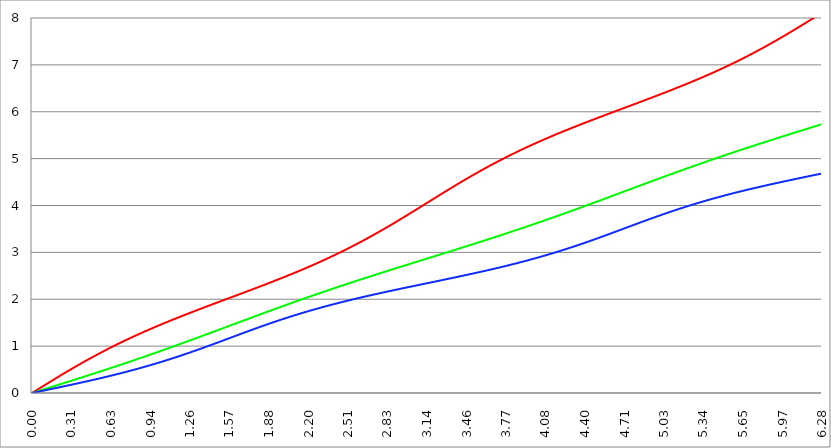
| Category | Series 1 | Series 0 | Series 2 |
|---|---|---|---|
| 0.0 | 0 | 0 | 0 |
| 0.00314159265358979 | 0.005 | 0.003 | 0.002 |
| 0.00628318530717958 | 0.01 | 0.005 | 0.003 |
| 0.00942477796076938 | 0.016 | 0.008 | 0.005 |
| 0.0125663706143592 | 0.021 | 0.01 | 0.007 |
| 0.015707963267949 | 0.026 | 0.013 | 0.009 |
| 0.0188495559215388 | 0.031 | 0.016 | 0.01 |
| 0.0219911485751285 | 0.037 | 0.018 | 0.012 |
| 0.0251327412287183 | 0.042 | 0.021 | 0.014 |
| 0.0282743338823081 | 0.047 | 0.024 | 0.016 |
| 0.0314159265358979 | 0.052 | 0.026 | 0.017 |
| 0.0345575191894877 | 0.058 | 0.029 | 0.019 |
| 0.0376991118430775 | 0.063 | 0.031 | 0.021 |
| 0.0408407044966673 | 0.068 | 0.034 | 0.023 |
| 0.0439822971502571 | 0.073 | 0.037 | 0.024 |
| 0.0471238898038469 | 0.079 | 0.039 | 0.026 |
| 0.0502654824574367 | 0.084 | 0.042 | 0.028 |
| 0.0534070751110265 | 0.089 | 0.045 | 0.03 |
| 0.0565486677646163 | 0.094 | 0.047 | 0.031 |
| 0.059690260418206 | 0.099 | 0.05 | 0.033 |
| 0.0628318530717958 | 0.105 | 0.052 | 0.035 |
| 0.0659734457253856 | 0.11 | 0.055 | 0.037 |
| 0.0691150383789754 | 0.115 | 0.058 | 0.038 |
| 0.0722566310325652 | 0.12 | 0.06 | 0.04 |
| 0.075398223686155 | 0.126 | 0.063 | 0.042 |
| 0.0785398163397448 | 0.131 | 0.065 | 0.044 |
| 0.0816814089933346 | 0.136 | 0.068 | 0.045 |
| 0.0848230016469244 | 0.141 | 0.071 | 0.047 |
| 0.0879645943005142 | 0.146 | 0.073 | 0.049 |
| 0.091106186954104 | 0.152 | 0.076 | 0.051 |
| 0.0942477796076937 | 0.157 | 0.079 | 0.052 |
| 0.0973893722612835 | 0.162 | 0.081 | 0.054 |
| 0.100530964914873 | 0.167 | 0.084 | 0.056 |
| 0.103672557568463 | 0.172 | 0.086 | 0.058 |
| 0.106814150222053 | 0.178 | 0.089 | 0.059 |
| 0.109955742875643 | 0.183 | 0.092 | 0.061 |
| 0.113097335529233 | 0.188 | 0.094 | 0.063 |
| 0.116238928182822 | 0.193 | 0.097 | 0.065 |
| 0.119380520836412 | 0.198 | 0.1 | 0.066 |
| 0.122522113490002 | 0.204 | 0.102 | 0.068 |
| 0.125663706143592 | 0.209 | 0.105 | 0.07 |
| 0.128805298797181 | 0.214 | 0.107 | 0.072 |
| 0.131946891450771 | 0.219 | 0.11 | 0.073 |
| 0.135088484104361 | 0.224 | 0.113 | 0.075 |
| 0.138230076757951 | 0.229 | 0.115 | 0.077 |
| 0.141371669411541 | 0.235 | 0.118 | 0.079 |
| 0.14451326206513 | 0.24 | 0.121 | 0.081 |
| 0.14765485471872 | 0.245 | 0.123 | 0.082 |
| 0.15079644737231 | 0.25 | 0.126 | 0.084 |
| 0.1539380400259 | 0.255 | 0.128 | 0.086 |
| 0.15707963267949 | 0.26 | 0.131 | 0.088 |
| 0.160221225333079 | 0.266 | 0.134 | 0.089 |
| 0.163362817986669 | 0.271 | 0.136 | 0.091 |
| 0.166504410640259 | 0.276 | 0.139 | 0.093 |
| 0.169646003293849 | 0.281 | 0.142 | 0.095 |
| 0.172787595947439 | 0.286 | 0.144 | 0.096 |
| 0.175929188601028 | 0.291 | 0.147 | 0.098 |
| 0.179070781254618 | 0.296 | 0.149 | 0.1 |
| 0.182212373908208 | 0.301 | 0.152 | 0.102 |
| 0.185353966561798 | 0.307 | 0.155 | 0.103 |
| 0.188495559215388 | 0.312 | 0.157 | 0.105 |
| 0.191637151868977 | 0.317 | 0.16 | 0.107 |
| 0.194778744522567 | 0.322 | 0.163 | 0.109 |
| 0.197920337176157 | 0.327 | 0.165 | 0.111 |
| 0.201061929829747 | 0.332 | 0.168 | 0.112 |
| 0.204203522483336 | 0.337 | 0.171 | 0.114 |
| 0.207345115136926 | 0.342 | 0.173 | 0.116 |
| 0.210486707790516 | 0.347 | 0.176 | 0.118 |
| 0.213628300444106 | 0.353 | 0.178 | 0.119 |
| 0.216769893097696 | 0.358 | 0.181 | 0.121 |
| 0.219911485751285 | 0.363 | 0.184 | 0.123 |
| 0.223053078404875 | 0.368 | 0.186 | 0.125 |
| 0.226194671058465 | 0.373 | 0.189 | 0.127 |
| 0.229336263712055 | 0.378 | 0.192 | 0.128 |
| 0.232477856365645 | 0.383 | 0.194 | 0.13 |
| 0.235619449019234 | 0.388 | 0.197 | 0.132 |
| 0.238761041672824 | 0.393 | 0.2 | 0.134 |
| 0.241902634326414 | 0.398 | 0.202 | 0.136 |
| 0.245044226980004 | 0.403 | 0.205 | 0.137 |
| 0.248185819633594 | 0.408 | 0.208 | 0.139 |
| 0.251327412287183 | 0.413 | 0.21 | 0.141 |
| 0.254469004940773 | 0.418 | 0.213 | 0.143 |
| 0.257610597594363 | 0.423 | 0.215 | 0.145 |
| 0.260752190247953 | 0.428 | 0.218 | 0.146 |
| 0.263893782901543 | 0.433 | 0.221 | 0.148 |
| 0.267035375555132 | 0.438 | 0.223 | 0.15 |
| 0.270176968208722 | 0.443 | 0.226 | 0.152 |
| 0.273318560862312 | 0.448 | 0.229 | 0.154 |
| 0.276460153515902 | 0.453 | 0.231 | 0.155 |
| 0.279601746169492 | 0.458 | 0.234 | 0.157 |
| 0.282743338823082 | 0.463 | 0.237 | 0.159 |
| 0.285884931476671 | 0.468 | 0.239 | 0.161 |
| 0.289026524130261 | 0.473 | 0.242 | 0.163 |
| 0.292168116783851 | 0.478 | 0.245 | 0.164 |
| 0.295309709437441 | 0.483 | 0.247 | 0.166 |
| 0.298451302091031 | 0.488 | 0.25 | 0.168 |
| 0.30159289474462 | 0.493 | 0.253 | 0.17 |
| 0.30473448739821 | 0.498 | 0.255 | 0.172 |
| 0.3078760800518 | 0.503 | 0.258 | 0.173 |
| 0.31101767270539 | 0.508 | 0.261 | 0.175 |
| 0.31415926535898 | 0.513 | 0.263 | 0.177 |
| 0.31730085801257 | 0.518 | 0.266 | 0.179 |
| 0.320442450666159 | 0.523 | 0.269 | 0.181 |
| 0.323584043319749 | 0.527 | 0.271 | 0.183 |
| 0.326725635973339 | 0.532 | 0.274 | 0.184 |
| 0.329867228626929 | 0.537 | 0.277 | 0.186 |
| 0.333008821280519 | 0.542 | 0.279 | 0.188 |
| 0.336150413934108 | 0.547 | 0.282 | 0.19 |
| 0.339292006587698 | 0.552 | 0.285 | 0.192 |
| 0.342433599241288 | 0.557 | 0.287 | 0.194 |
| 0.345575191894878 | 0.562 | 0.29 | 0.195 |
| 0.348716784548468 | 0.567 | 0.293 | 0.197 |
| 0.351858377202058 | 0.571 | 0.295 | 0.199 |
| 0.354999969855647 | 0.576 | 0.298 | 0.201 |
| 0.358141562509237 | 0.581 | 0.301 | 0.203 |
| 0.361283155162827 | 0.586 | 0.303 | 0.205 |
| 0.364424747816417 | 0.591 | 0.306 | 0.206 |
| 0.367566340470007 | 0.596 | 0.309 | 0.208 |
| 0.370707933123597 | 0.6 | 0.311 | 0.21 |
| 0.373849525777186 | 0.605 | 0.314 | 0.212 |
| 0.376991118430776 | 0.61 | 0.317 | 0.214 |
| 0.380132711084366 | 0.615 | 0.319 | 0.216 |
| 0.383274303737956 | 0.62 | 0.322 | 0.218 |
| 0.386415896391546 | 0.624 | 0.325 | 0.219 |
| 0.389557489045135 | 0.629 | 0.327 | 0.221 |
| 0.392699081698725 | 0.634 | 0.33 | 0.223 |
| 0.395840674352315 | 0.639 | 0.333 | 0.225 |
| 0.398982267005905 | 0.643 | 0.335 | 0.227 |
| 0.402123859659495 | 0.648 | 0.338 | 0.229 |
| 0.405265452313085 | 0.653 | 0.341 | 0.231 |
| 0.408407044966674 | 0.658 | 0.343 | 0.233 |
| 0.411548637620264 | 0.662 | 0.346 | 0.234 |
| 0.414690230273854 | 0.667 | 0.349 | 0.236 |
| 0.417831822927444 | 0.672 | 0.352 | 0.238 |
| 0.420973415581034 | 0.677 | 0.354 | 0.24 |
| 0.424115008234623 | 0.681 | 0.357 | 0.242 |
| 0.427256600888213 | 0.686 | 0.36 | 0.244 |
| 0.430398193541803 | 0.691 | 0.362 | 0.246 |
| 0.433539786195393 | 0.695 | 0.365 | 0.248 |
| 0.436681378848983 | 0.7 | 0.368 | 0.25 |
| 0.439822971502573 | 0.705 | 0.37 | 0.251 |
| 0.442964564156162 | 0.709 | 0.373 | 0.253 |
| 0.446106156809752 | 0.714 | 0.376 | 0.255 |
| 0.449247749463342 | 0.719 | 0.378 | 0.257 |
| 0.452389342116932 | 0.723 | 0.381 | 0.259 |
| 0.455530934770522 | 0.728 | 0.384 | 0.261 |
| 0.458672527424111 | 0.733 | 0.387 | 0.263 |
| 0.461814120077701 | 0.737 | 0.389 | 0.265 |
| 0.464955712731291 | 0.742 | 0.392 | 0.267 |
| 0.468097305384881 | 0.747 | 0.395 | 0.269 |
| 0.471238898038471 | 0.751 | 0.397 | 0.271 |
| 0.474380490692061 | 0.756 | 0.4 | 0.272 |
| 0.47752208334565 | 0.76 | 0.403 | 0.274 |
| 0.48066367599924 | 0.765 | 0.406 | 0.276 |
| 0.48380526865283 | 0.77 | 0.408 | 0.278 |
| 0.48694686130642 | 0.774 | 0.411 | 0.28 |
| 0.49008845396001 | 0.779 | 0.414 | 0.282 |
| 0.493230046613599 | 0.783 | 0.416 | 0.284 |
| 0.496371639267189 | 0.788 | 0.419 | 0.286 |
| 0.499513231920779 | 0.792 | 0.422 | 0.288 |
| 0.502654824574369 | 0.797 | 0.425 | 0.29 |
| 0.505796417227959 | 0.801 | 0.427 | 0.292 |
| 0.508938009881549 | 0.806 | 0.43 | 0.294 |
| 0.512079602535138 | 0.81 | 0.433 | 0.296 |
| 0.515221195188728 | 0.815 | 0.436 | 0.298 |
| 0.518362787842318 | 0.819 | 0.438 | 0.3 |
| 0.521504380495908 | 0.824 | 0.441 | 0.302 |
| 0.524645973149498 | 0.828 | 0.444 | 0.304 |
| 0.527787565803087 | 0.833 | 0.446 | 0.306 |
| 0.530929158456677 | 0.837 | 0.449 | 0.307 |
| 0.534070751110267 | 0.842 | 0.452 | 0.309 |
| 0.537212343763857 | 0.846 | 0.455 | 0.311 |
| 0.540353936417447 | 0.851 | 0.457 | 0.313 |
| 0.543495529071037 | 0.855 | 0.46 | 0.315 |
| 0.546637121724626 | 0.86 | 0.463 | 0.317 |
| 0.549778714378216 | 0.864 | 0.466 | 0.319 |
| 0.552920307031806 | 0.868 | 0.468 | 0.321 |
| 0.556061899685396 | 0.873 | 0.471 | 0.323 |
| 0.559203492338986 | 0.877 | 0.474 | 0.325 |
| 0.562345084992576 | 0.882 | 0.477 | 0.327 |
| 0.565486677646165 | 0.886 | 0.479 | 0.329 |
| 0.568628270299755 | 0.891 | 0.482 | 0.331 |
| 0.571769862953345 | 0.895 | 0.485 | 0.333 |
| 0.574911455606935 | 0.899 | 0.488 | 0.335 |
| 0.578053048260525 | 0.904 | 0.49 | 0.337 |
| 0.581194640914114 | 0.908 | 0.493 | 0.339 |
| 0.584336233567704 | 0.912 | 0.496 | 0.341 |
| 0.587477826221294 | 0.917 | 0.499 | 0.343 |
| 0.590619418874884 | 0.921 | 0.501 | 0.345 |
| 0.593761011528474 | 0.925 | 0.504 | 0.347 |
| 0.596902604182064 | 0.93 | 0.507 | 0.349 |
| 0.600044196835653 | 0.934 | 0.51 | 0.352 |
| 0.603185789489243 | 0.938 | 0.512 | 0.354 |
| 0.606327382142833 | 0.943 | 0.515 | 0.356 |
| 0.609468974796423 | 0.947 | 0.518 | 0.358 |
| 0.612610567450013 | 0.951 | 0.521 | 0.36 |
| 0.615752160103602 | 0.956 | 0.524 | 0.362 |
| 0.618893752757192 | 0.96 | 0.526 | 0.364 |
| 0.622035345410782 | 0.964 | 0.529 | 0.366 |
| 0.625176938064372 | 0.968 | 0.532 | 0.368 |
| 0.628318530717962 | 0.973 | 0.535 | 0.37 |
| 0.631460123371551 | 0.977 | 0.537 | 0.372 |
| 0.634601716025141 | 0.981 | 0.54 | 0.374 |
| 0.637743308678731 | 0.985 | 0.543 | 0.376 |
| 0.640884901332321 | 0.99 | 0.546 | 0.378 |
| 0.644026493985911 | 0.994 | 0.549 | 0.38 |
| 0.647168086639501 | 0.998 | 0.551 | 0.382 |
| 0.65030967929309 | 1.002 | 0.554 | 0.384 |
| 0.65345127194668 | 1.006 | 0.557 | 0.387 |
| 0.65659286460027 | 1.011 | 0.56 | 0.389 |
| 0.65973445725386 | 1.015 | 0.562 | 0.391 |
| 0.66287604990745 | 1.019 | 0.565 | 0.393 |
| 0.666017642561039 | 1.023 | 0.568 | 0.395 |
| 0.669159235214629 | 1.027 | 0.571 | 0.397 |
| 0.672300827868219 | 1.032 | 0.574 | 0.399 |
| 0.675442420521809 | 1.036 | 0.576 | 0.401 |
| 0.678584013175399 | 1.04 | 0.579 | 0.403 |
| 0.681725605828989 | 1.044 | 0.582 | 0.405 |
| 0.684867198482578 | 1.048 | 0.585 | 0.408 |
| 0.688008791136168 | 1.052 | 0.588 | 0.41 |
| 0.691150383789758 | 1.056 | 0.59 | 0.412 |
| 0.694291976443348 | 1.06 | 0.593 | 0.414 |
| 0.697433569096938 | 1.065 | 0.596 | 0.416 |
| 0.700575161750528 | 1.069 | 0.599 | 0.418 |
| 0.703716754404117 | 1.073 | 0.602 | 0.42 |
| 0.706858347057707 | 1.077 | 0.605 | 0.423 |
| 0.709999939711297 | 1.081 | 0.607 | 0.425 |
| 0.713141532364887 | 1.085 | 0.61 | 0.427 |
| 0.716283125018477 | 1.089 | 0.613 | 0.429 |
| 0.719424717672066 | 1.093 | 0.616 | 0.431 |
| 0.722566310325656 | 1.097 | 0.619 | 0.433 |
| 0.725707902979246 | 1.101 | 0.621 | 0.435 |
| 0.728849495632836 | 1.105 | 0.624 | 0.438 |
| 0.731991088286426 | 1.109 | 0.627 | 0.44 |
| 0.735132680940016 | 1.113 | 0.63 | 0.442 |
| 0.738274273593605 | 1.117 | 0.633 | 0.444 |
| 0.741415866247195 | 1.121 | 0.636 | 0.446 |
| 0.744557458900785 | 1.125 | 0.638 | 0.449 |
| 0.747699051554375 | 1.129 | 0.641 | 0.451 |
| 0.750840644207965 | 1.133 | 0.644 | 0.453 |
| 0.753982236861554 | 1.137 | 0.647 | 0.455 |
| 0.757123829515144 | 1.141 | 0.65 | 0.457 |
| 0.760265422168734 | 1.145 | 0.653 | 0.46 |
| 0.763407014822324 | 1.149 | 0.655 | 0.462 |
| 0.766548607475914 | 1.153 | 0.658 | 0.464 |
| 0.769690200129504 | 1.157 | 0.661 | 0.466 |
| 0.772831792783093 | 1.161 | 0.664 | 0.468 |
| 0.775973385436683 | 1.165 | 0.667 | 0.471 |
| 0.779114978090273 | 1.169 | 0.67 | 0.473 |
| 0.782256570743863 | 1.173 | 0.673 | 0.475 |
| 0.785398163397453 | 1.177 | 0.675 | 0.477 |
| 0.788539756051042 | 1.181 | 0.678 | 0.48 |
| 0.791681348704632 | 1.185 | 0.681 | 0.482 |
| 0.794822941358222 | 1.189 | 0.684 | 0.484 |
| 0.797964534011812 | 1.193 | 0.687 | 0.486 |
| 0.801106126665402 | 1.197 | 0.69 | 0.489 |
| 0.804247719318992 | 1.201 | 0.693 | 0.491 |
| 0.807389311972581 | 1.204 | 0.695 | 0.493 |
| 0.810530904626171 | 1.208 | 0.698 | 0.495 |
| 0.813672497279761 | 1.212 | 0.701 | 0.498 |
| 0.816814089933351 | 1.216 | 0.704 | 0.5 |
| 0.819955682586941 | 1.22 | 0.707 | 0.502 |
| 0.823097275240531 | 1.224 | 0.71 | 0.505 |
| 0.82623886789412 | 1.228 | 0.713 | 0.507 |
| 0.82938046054771 | 1.231 | 0.716 | 0.509 |
| 0.8325220532013 | 1.235 | 0.718 | 0.512 |
| 0.83566364585489 | 1.239 | 0.721 | 0.514 |
| 0.83880523850848 | 1.243 | 0.724 | 0.516 |
| 0.841946831162069 | 1.247 | 0.727 | 0.518 |
| 0.845088423815659 | 1.251 | 0.73 | 0.521 |
| 0.848230016469249 | 1.254 | 0.733 | 0.523 |
| 0.851371609122839 | 1.258 | 0.736 | 0.525 |
| 0.854513201776429 | 1.262 | 0.739 | 0.528 |
| 0.857654794430019 | 1.266 | 0.742 | 0.53 |
| 0.860796387083608 | 1.27 | 0.744 | 0.532 |
| 0.863937979737198 | 1.273 | 0.747 | 0.535 |
| 0.867079572390788 | 1.277 | 0.75 | 0.537 |
| 0.870221165044378 | 1.281 | 0.753 | 0.54 |
| 0.873362757697968 | 1.285 | 0.756 | 0.542 |
| 0.876504350351557 | 1.288 | 0.759 | 0.544 |
| 0.879645943005147 | 1.292 | 0.762 | 0.547 |
| 0.882787535658737 | 1.296 | 0.765 | 0.549 |
| 0.885929128312327 | 1.3 | 0.768 | 0.551 |
| 0.889070720965917 | 1.303 | 0.771 | 0.554 |
| 0.892212313619507 | 1.307 | 0.773 | 0.556 |
| 0.895353906273096 | 1.311 | 0.776 | 0.559 |
| 0.898495498926686 | 1.315 | 0.779 | 0.561 |
| 0.901637091580276 | 1.318 | 0.782 | 0.563 |
| 0.904778684233866 | 1.322 | 0.785 | 0.566 |
| 0.907920276887456 | 1.326 | 0.788 | 0.568 |
| 0.911061869541045 | 1.329 | 0.791 | 0.571 |
| 0.914203462194635 | 1.333 | 0.794 | 0.573 |
| 0.917345054848225 | 1.337 | 0.797 | 0.575 |
| 0.920486647501815 | 1.34 | 0.8 | 0.578 |
| 0.923628240155405 | 1.344 | 0.803 | 0.58 |
| 0.926769832808995 | 1.348 | 0.806 | 0.583 |
| 0.929911425462584 | 1.352 | 0.809 | 0.585 |
| 0.933053018116174 | 1.355 | 0.811 | 0.588 |
| 0.936194610769764 | 1.359 | 0.814 | 0.59 |
| 0.939336203423354 | 1.362 | 0.817 | 0.592 |
| 0.942477796076944 | 1.366 | 0.82 | 0.595 |
| 0.945619388730533 | 1.37 | 0.823 | 0.597 |
| 0.948760981384123 | 1.373 | 0.826 | 0.6 |
| 0.951902574037713 | 1.377 | 0.829 | 0.602 |
| 0.955044166691303 | 1.381 | 0.832 | 0.605 |
| 0.958185759344893 | 1.384 | 0.835 | 0.607 |
| 0.961327351998483 | 1.388 | 0.838 | 0.61 |
| 0.964468944652072 | 1.392 | 0.841 | 0.612 |
| 0.967610537305662 | 1.395 | 0.844 | 0.615 |
| 0.970752129959252 | 1.399 | 0.847 | 0.617 |
| 0.973893722612842 | 1.402 | 0.85 | 0.62 |
| 0.977035315266432 | 1.406 | 0.853 | 0.622 |
| 0.980176907920022 | 1.41 | 0.856 | 0.625 |
| 0.983318500573611 | 1.413 | 0.859 | 0.627 |
| 0.986460093227201 | 1.417 | 0.862 | 0.63 |
| 0.989601685880791 | 1.42 | 0.865 | 0.632 |
| 0.992743278534381 | 1.424 | 0.868 | 0.635 |
| 0.995884871187971 | 1.427 | 0.87 | 0.637 |
| 0.99902646384156 | 1.431 | 0.873 | 0.64 |
| 1.00216805649515 | 1.435 | 0.876 | 0.643 |
| 1.00530964914874 | 1.438 | 0.879 | 0.645 |
| 1.00845124180233 | 1.442 | 0.882 | 0.648 |
| 1.01159283445592 | 1.445 | 0.885 | 0.65 |
| 1.01473442710951 | 1.449 | 0.888 | 0.653 |
| 1.017876019763099 | 1.452 | 0.891 | 0.655 |
| 1.021017612416689 | 1.456 | 0.894 | 0.658 |
| 1.02415920507028 | 1.459 | 0.897 | 0.66 |
| 1.027300797723869 | 1.463 | 0.9 | 0.663 |
| 1.030442390377459 | 1.466 | 0.903 | 0.666 |
| 1.033583983031048 | 1.47 | 0.906 | 0.668 |
| 1.036725575684638 | 1.473 | 0.909 | 0.671 |
| 1.039867168338228 | 1.477 | 0.912 | 0.673 |
| 1.043008760991818 | 1.48 | 0.915 | 0.676 |
| 1.046150353645408 | 1.484 | 0.918 | 0.679 |
| 1.049291946298998 | 1.487 | 0.921 | 0.681 |
| 1.052433538952587 | 1.491 | 0.924 | 0.684 |
| 1.055575131606177 | 1.494 | 0.927 | 0.687 |
| 1.058716724259767 | 1.498 | 0.93 | 0.689 |
| 1.061858316913357 | 1.501 | 0.933 | 0.692 |
| 1.064999909566947 | 1.505 | 0.936 | 0.694 |
| 1.068141502220536 | 1.508 | 0.939 | 0.697 |
| 1.071283094874126 | 1.512 | 0.942 | 0.7 |
| 1.074424687527716 | 1.515 | 0.945 | 0.702 |
| 1.077566280181306 | 1.519 | 0.948 | 0.705 |
| 1.080707872834896 | 1.522 | 0.951 | 0.708 |
| 1.083849465488486 | 1.525 | 0.954 | 0.71 |
| 1.086991058142075 | 1.529 | 0.957 | 0.713 |
| 1.090132650795665 | 1.532 | 0.96 | 0.716 |
| 1.093274243449255 | 1.536 | 0.963 | 0.718 |
| 1.096415836102845 | 1.539 | 0.966 | 0.721 |
| 1.099557428756435 | 1.543 | 0.969 | 0.724 |
| 1.102699021410025 | 1.546 | 0.972 | 0.727 |
| 1.105840614063614 | 1.549 | 0.975 | 0.729 |
| 1.108982206717204 | 1.553 | 0.978 | 0.732 |
| 1.112123799370794 | 1.556 | 0.981 | 0.735 |
| 1.115265392024384 | 1.56 | 0.984 | 0.737 |
| 1.118406984677974 | 1.563 | 0.987 | 0.74 |
| 1.121548577331563 | 1.566 | 0.99 | 0.743 |
| 1.124690169985153 | 1.57 | 0.993 | 0.746 |
| 1.127831762638743 | 1.573 | 0.996 | 0.748 |
| 1.130973355292333 | 1.577 | 0.999 | 0.751 |
| 1.134114947945923 | 1.58 | 1.002 | 0.754 |
| 1.137256540599513 | 1.583 | 1.006 | 0.757 |
| 1.140398133253102 | 1.587 | 1.009 | 0.759 |
| 1.143539725906692 | 1.59 | 1.012 | 0.762 |
| 1.146681318560282 | 1.594 | 1.015 | 0.765 |
| 1.149822911213872 | 1.597 | 1.018 | 0.768 |
| 1.152964503867462 | 1.6 | 1.021 | 0.77 |
| 1.156106096521051 | 1.604 | 1.024 | 0.773 |
| 1.159247689174641 | 1.607 | 1.027 | 0.776 |
| 1.162389281828231 | 1.61 | 1.03 | 0.779 |
| 1.165530874481821 | 1.614 | 1.033 | 0.782 |
| 1.168672467135411 | 1.617 | 1.036 | 0.784 |
| 1.171814059789001 | 1.62 | 1.039 | 0.787 |
| 1.17495565244259 | 1.624 | 1.042 | 0.79 |
| 1.17809724509618 | 1.627 | 1.045 | 0.793 |
| 1.18123883774977 | 1.63 | 1.048 | 0.796 |
| 1.18438043040336 | 1.634 | 1.051 | 0.798 |
| 1.18752202305695 | 1.637 | 1.054 | 0.801 |
| 1.190663615710539 | 1.64 | 1.057 | 0.804 |
| 1.193805208364129 | 1.644 | 1.06 | 0.807 |
| 1.19694680101772 | 1.647 | 1.063 | 0.81 |
| 1.200088393671309 | 1.65 | 1.066 | 0.813 |
| 1.203229986324899 | 1.654 | 1.07 | 0.815 |
| 1.206371578978489 | 1.657 | 1.073 | 0.818 |
| 1.209513171632078 | 1.66 | 1.076 | 0.821 |
| 1.212654764285668 | 1.664 | 1.079 | 0.824 |
| 1.215796356939258 | 1.667 | 1.082 | 0.827 |
| 1.218937949592848 | 1.67 | 1.085 | 0.83 |
| 1.222079542246438 | 1.673 | 1.088 | 0.833 |
| 1.225221134900027 | 1.677 | 1.091 | 0.835 |
| 1.228362727553617 | 1.68 | 1.094 | 0.838 |
| 1.231504320207207 | 1.683 | 1.097 | 0.841 |
| 1.234645912860797 | 1.687 | 1.1 | 0.844 |
| 1.237787505514387 | 1.69 | 1.103 | 0.847 |
| 1.240929098167977 | 1.693 | 1.106 | 0.85 |
| 1.244070690821566 | 1.696 | 1.109 | 0.853 |
| 1.247212283475156 | 1.7 | 1.113 | 0.856 |
| 1.250353876128746 | 1.703 | 1.116 | 0.859 |
| 1.253495468782336 | 1.706 | 1.119 | 0.861 |
| 1.256637061435926 | 1.71 | 1.122 | 0.864 |
| 1.259778654089515 | 1.713 | 1.125 | 0.867 |
| 1.262920246743105 | 1.716 | 1.128 | 0.87 |
| 1.266061839396695 | 1.719 | 1.131 | 0.873 |
| 1.269203432050285 | 1.723 | 1.134 | 0.876 |
| 1.272345024703875 | 1.726 | 1.137 | 0.879 |
| 1.275486617357465 | 1.729 | 1.14 | 0.882 |
| 1.278628210011054 | 1.732 | 1.143 | 0.885 |
| 1.281769802664644 | 1.736 | 1.146 | 0.888 |
| 1.284911395318234 | 1.739 | 1.15 | 0.891 |
| 1.288052987971824 | 1.742 | 1.153 | 0.894 |
| 1.291194580625414 | 1.745 | 1.156 | 0.897 |
| 1.294336173279003 | 1.749 | 1.159 | 0.9 |
| 1.297477765932593 | 1.752 | 1.162 | 0.903 |
| 1.300619358586183 | 1.755 | 1.165 | 0.906 |
| 1.303760951239773 | 1.758 | 1.168 | 0.909 |
| 1.306902543893363 | 1.762 | 1.171 | 0.912 |
| 1.310044136546953 | 1.765 | 1.174 | 0.915 |
| 1.313185729200542 | 1.768 | 1.177 | 0.918 |
| 1.316327321854132 | 1.771 | 1.181 | 0.921 |
| 1.319468914507722 | 1.774 | 1.184 | 0.924 |
| 1.322610507161312 | 1.778 | 1.187 | 0.927 |
| 1.325752099814902 | 1.781 | 1.19 | 0.93 |
| 1.328893692468491 | 1.784 | 1.193 | 0.933 |
| 1.332035285122081 | 1.787 | 1.196 | 0.936 |
| 1.335176877775671 | 1.791 | 1.199 | 0.939 |
| 1.338318470429261 | 1.794 | 1.202 | 0.942 |
| 1.341460063082851 | 1.797 | 1.205 | 0.945 |
| 1.344601655736441 | 1.8 | 1.208 | 0.948 |
| 1.34774324839003 | 1.803 | 1.212 | 0.951 |
| 1.35088484104362 | 1.807 | 1.215 | 0.954 |
| 1.35402643369721 | 1.81 | 1.218 | 0.957 |
| 1.3571680263508 | 1.813 | 1.221 | 0.96 |
| 1.36030961900439 | 1.816 | 1.224 | 0.963 |
| 1.363451211657979 | 1.819 | 1.227 | 0.966 |
| 1.36659280431157 | 1.823 | 1.23 | 0.969 |
| 1.369734396965159 | 1.826 | 1.233 | 0.972 |
| 1.372875989618749 | 1.829 | 1.237 | 0.975 |
| 1.376017582272339 | 1.832 | 1.24 | 0.978 |
| 1.379159174925929 | 1.835 | 1.243 | 0.981 |
| 1.382300767579518 | 1.838 | 1.246 | 0.984 |
| 1.385442360233108 | 1.842 | 1.249 | 0.987 |
| 1.388583952886698 | 1.845 | 1.252 | 0.99 |
| 1.391725545540288 | 1.848 | 1.255 | 0.993 |
| 1.394867138193878 | 1.851 | 1.258 | 0.996 |
| 1.398008730847468 | 1.854 | 1.261 | 0.999 |
| 1.401150323501057 | 1.858 | 1.265 | 1.002 |
| 1.404291916154647 | 1.861 | 1.268 | 1.006 |
| 1.407433508808237 | 1.864 | 1.271 | 1.009 |
| 1.410575101461827 | 1.867 | 1.274 | 1.012 |
| 1.413716694115417 | 1.87 | 1.277 | 1.015 |
| 1.416858286769006 | 1.873 | 1.28 | 1.018 |
| 1.419999879422596 | 1.877 | 1.283 | 1.021 |
| 1.423141472076186 | 1.88 | 1.286 | 1.024 |
| 1.426283064729776 | 1.883 | 1.29 | 1.027 |
| 1.429424657383366 | 1.886 | 1.293 | 1.03 |
| 1.432566250036956 | 1.889 | 1.296 | 1.033 |
| 1.435707842690545 | 1.892 | 1.299 | 1.036 |
| 1.438849435344135 | 1.896 | 1.302 | 1.039 |
| 1.441991027997725 | 1.899 | 1.305 | 1.043 |
| 1.445132620651315 | 1.902 | 1.308 | 1.046 |
| 1.448274213304905 | 1.905 | 1.312 | 1.049 |
| 1.451415805958494 | 1.908 | 1.315 | 1.052 |
| 1.454557398612084 | 1.911 | 1.318 | 1.055 |
| 1.457698991265674 | 1.915 | 1.321 | 1.058 |
| 1.460840583919264 | 1.918 | 1.324 | 1.061 |
| 1.463982176572854 | 1.921 | 1.327 | 1.064 |
| 1.467123769226444 | 1.924 | 1.33 | 1.067 |
| 1.470265361880033 | 1.927 | 1.333 | 1.071 |
| 1.473406954533623 | 1.93 | 1.337 | 1.074 |
| 1.476548547187213 | 1.934 | 1.34 | 1.077 |
| 1.479690139840803 | 1.937 | 1.343 | 1.08 |
| 1.482831732494393 | 1.94 | 1.346 | 1.083 |
| 1.485973325147982 | 1.943 | 1.349 | 1.086 |
| 1.489114917801572 | 1.946 | 1.352 | 1.089 |
| 1.492256510455162 | 1.949 | 1.355 | 1.092 |
| 1.495398103108752 | 1.952 | 1.359 | 1.096 |
| 1.498539695762342 | 1.956 | 1.362 | 1.099 |
| 1.501681288415932 | 1.959 | 1.365 | 1.102 |
| 1.504822881069521 | 1.962 | 1.368 | 1.105 |
| 1.507964473723111 | 1.965 | 1.371 | 1.108 |
| 1.511106066376701 | 1.968 | 1.374 | 1.111 |
| 1.514247659030291 | 1.971 | 1.377 | 1.114 |
| 1.517389251683881 | 1.974 | 1.381 | 1.117 |
| 1.520530844337471 | 1.978 | 1.384 | 1.121 |
| 1.52367243699106 | 1.981 | 1.387 | 1.124 |
| 1.52681402964465 | 1.984 | 1.39 | 1.127 |
| 1.52995562229824 | 1.987 | 1.393 | 1.13 |
| 1.53309721495183 | 1.99 | 1.396 | 1.133 |
| 1.53623880760542 | 1.993 | 1.399 | 1.136 |
| 1.539380400259009 | 1.996 | 1.403 | 1.139 |
| 1.542521992912599 | 2 | 1.406 | 1.143 |
| 1.545663585566189 | 2.003 | 1.409 | 1.146 |
| 1.548805178219779 | 2.006 | 1.412 | 1.149 |
| 1.551946770873369 | 2.009 | 1.415 | 1.152 |
| 1.555088363526959 | 2.012 | 1.418 | 1.155 |
| 1.558229956180548 | 2.015 | 1.421 | 1.158 |
| 1.561371548834138 | 2.018 | 1.425 | 1.161 |
| 1.564513141487728 | 2.022 | 1.428 | 1.165 |
| 1.567654734141318 | 2.025 | 1.431 | 1.168 |
| 1.570796326794908 | 2.028 | 1.434 | 1.171 |
| 1.573937919448497 | 2.031 | 1.437 | 1.174 |
| 1.577079512102087 | 2.034 | 1.44 | 1.177 |
| 1.580221104755677 | 2.037 | 1.443 | 1.18 |
| 1.583362697409267 | 2.04 | 1.447 | 1.183 |
| 1.586504290062857 | 2.044 | 1.45 | 1.187 |
| 1.589645882716447 | 2.047 | 1.453 | 1.19 |
| 1.592787475370036 | 2.05 | 1.456 | 1.193 |
| 1.595929068023626 | 2.053 | 1.459 | 1.196 |
| 1.599070660677216 | 2.056 | 1.462 | 1.199 |
| 1.602212253330806 | 2.059 | 1.465 | 1.202 |
| 1.605353845984396 | 2.062 | 1.468 | 1.205 |
| 1.608495438637985 | 2.066 | 1.472 | 1.208 |
| 1.611637031291575 | 2.069 | 1.475 | 1.212 |
| 1.614778623945165 | 2.072 | 1.478 | 1.215 |
| 1.617920216598755 | 2.075 | 1.481 | 1.218 |
| 1.621061809252345 | 2.078 | 1.484 | 1.221 |
| 1.624203401905935 | 2.081 | 1.487 | 1.224 |
| 1.627344994559524 | 2.084 | 1.49 | 1.227 |
| 1.630486587213114 | 2.088 | 1.494 | 1.23 |
| 1.633628179866704 | 2.091 | 1.497 | 1.234 |
| 1.636769772520294 | 2.094 | 1.5 | 1.237 |
| 1.639911365173884 | 2.097 | 1.503 | 1.24 |
| 1.643052957827473 | 2.1 | 1.506 | 1.243 |
| 1.646194550481063 | 2.103 | 1.509 | 1.246 |
| 1.649336143134653 | 2.106 | 1.512 | 1.249 |
| 1.652477735788243 | 2.11 | 1.516 | 1.252 |
| 1.655619328441833 | 2.113 | 1.519 | 1.255 |
| 1.658760921095423 | 2.116 | 1.522 | 1.259 |
| 1.661902513749012 | 2.119 | 1.525 | 1.262 |
| 1.665044106402602 | 2.122 | 1.528 | 1.265 |
| 1.668185699056192 | 2.125 | 1.531 | 1.268 |
| 1.671327291709782 | 2.129 | 1.534 | 1.271 |
| 1.674468884363372 | 2.132 | 1.538 | 1.274 |
| 1.677610477016961 | 2.135 | 1.541 | 1.277 |
| 1.680752069670551 | 2.138 | 1.544 | 1.28 |
| 1.683893662324141 | 2.141 | 1.547 | 1.284 |
| 1.687035254977731 | 2.144 | 1.55 | 1.287 |
| 1.690176847631321 | 2.147 | 1.553 | 1.29 |
| 1.693318440284911 | 2.151 | 1.556 | 1.293 |
| 1.6964600329385 | 2.154 | 1.559 | 1.296 |
| 1.69960162559209 | 2.157 | 1.563 | 1.299 |
| 1.70274321824568 | 2.16 | 1.566 | 1.302 |
| 1.70588481089927 | 2.163 | 1.569 | 1.305 |
| 1.70902640355286 | 2.166 | 1.572 | 1.308 |
| 1.712167996206449 | 2.17 | 1.575 | 1.311 |
| 1.715309588860039 | 2.173 | 1.578 | 1.315 |
| 1.71845118151363 | 2.176 | 1.581 | 1.318 |
| 1.721592774167219 | 2.179 | 1.585 | 1.321 |
| 1.724734366820809 | 2.182 | 1.588 | 1.324 |
| 1.727875959474399 | 2.185 | 1.591 | 1.327 |
| 1.731017552127988 | 2.189 | 1.594 | 1.33 |
| 1.734159144781578 | 2.192 | 1.597 | 1.333 |
| 1.737300737435168 | 2.195 | 1.6 | 1.336 |
| 1.740442330088758 | 2.198 | 1.603 | 1.339 |
| 1.743583922742348 | 2.201 | 1.606 | 1.342 |
| 1.746725515395937 | 2.205 | 1.61 | 1.345 |
| 1.749867108049527 | 2.208 | 1.613 | 1.348 |
| 1.753008700703117 | 2.211 | 1.616 | 1.351 |
| 1.756150293356707 | 2.214 | 1.619 | 1.354 |
| 1.759291886010297 | 2.217 | 1.622 | 1.358 |
| 1.762433478663887 | 2.22 | 1.625 | 1.361 |
| 1.765575071317476 | 2.224 | 1.628 | 1.364 |
| 1.768716663971066 | 2.227 | 1.631 | 1.367 |
| 1.771858256624656 | 2.23 | 1.634 | 1.37 |
| 1.774999849278246 | 2.233 | 1.638 | 1.373 |
| 1.778141441931836 | 2.236 | 1.641 | 1.376 |
| 1.781283034585426 | 2.24 | 1.644 | 1.379 |
| 1.784424627239015 | 2.243 | 1.647 | 1.382 |
| 1.787566219892605 | 2.246 | 1.65 | 1.385 |
| 1.790707812546195 | 2.249 | 1.653 | 1.388 |
| 1.793849405199785 | 2.252 | 1.656 | 1.391 |
| 1.796990997853375 | 2.256 | 1.659 | 1.394 |
| 1.800132590506964 | 2.259 | 1.662 | 1.397 |
| 1.803274183160554 | 2.262 | 1.666 | 1.4 |
| 1.806415775814144 | 2.265 | 1.669 | 1.403 |
| 1.809557368467734 | 2.268 | 1.672 | 1.406 |
| 1.812698961121324 | 2.272 | 1.675 | 1.409 |
| 1.815840553774914 | 2.275 | 1.678 | 1.412 |
| 1.818982146428503 | 2.278 | 1.681 | 1.415 |
| 1.822123739082093 | 2.281 | 1.684 | 1.418 |
| 1.825265331735683 | 2.285 | 1.687 | 1.421 |
| 1.828406924389273 | 2.288 | 1.69 | 1.424 |
| 1.831548517042863 | 2.291 | 1.694 | 1.427 |
| 1.834690109696452 | 2.294 | 1.697 | 1.43 |
| 1.837831702350042 | 2.297 | 1.7 | 1.433 |
| 1.840973295003632 | 2.301 | 1.703 | 1.436 |
| 1.844114887657222 | 2.304 | 1.706 | 1.439 |
| 1.847256480310812 | 2.307 | 1.709 | 1.442 |
| 1.850398072964402 | 2.31 | 1.712 | 1.445 |
| 1.853539665617991 | 2.314 | 1.715 | 1.448 |
| 1.856681258271581 | 2.317 | 1.718 | 1.451 |
| 1.859822850925171 | 2.32 | 1.721 | 1.454 |
| 1.862964443578761 | 2.323 | 1.724 | 1.457 |
| 1.866106036232351 | 2.327 | 1.728 | 1.46 |
| 1.86924762888594 | 2.33 | 1.731 | 1.463 |
| 1.87238922153953 | 2.333 | 1.734 | 1.466 |
| 1.87553081419312 | 2.336 | 1.737 | 1.468 |
| 1.87867240684671 | 2.34 | 1.74 | 1.471 |
| 1.8818139995003 | 2.343 | 1.743 | 1.474 |
| 1.88495559215389 | 2.346 | 1.746 | 1.477 |
| 1.888097184807479 | 2.349 | 1.749 | 1.48 |
| 1.891238777461069 | 2.353 | 1.752 | 1.483 |
| 1.89438037011466 | 2.356 | 1.755 | 1.486 |
| 1.897521962768249 | 2.359 | 1.758 | 1.489 |
| 1.900663555421839 | 2.363 | 1.761 | 1.492 |
| 1.903805148075429 | 2.366 | 1.765 | 1.495 |
| 1.906946740729018 | 2.369 | 1.768 | 1.498 |
| 1.910088333382608 | 2.372 | 1.771 | 1.5 |
| 1.913229926036198 | 2.376 | 1.774 | 1.503 |
| 1.916371518689788 | 2.379 | 1.777 | 1.506 |
| 1.919513111343378 | 2.382 | 1.78 | 1.509 |
| 1.922654703996967 | 2.386 | 1.783 | 1.512 |
| 1.925796296650557 | 2.389 | 1.786 | 1.515 |
| 1.928937889304147 | 2.392 | 1.789 | 1.518 |
| 1.932079481957737 | 2.395 | 1.792 | 1.521 |
| 1.935221074611327 | 2.399 | 1.795 | 1.523 |
| 1.938362667264917 | 2.402 | 1.798 | 1.526 |
| 1.941504259918506 | 2.405 | 1.801 | 1.529 |
| 1.944645852572096 | 2.409 | 1.804 | 1.532 |
| 1.947787445225686 | 2.412 | 1.808 | 1.535 |
| 1.950929037879276 | 2.415 | 1.811 | 1.538 |
| 1.954070630532866 | 2.419 | 1.814 | 1.54 |
| 1.957212223186455 | 2.422 | 1.817 | 1.543 |
| 1.960353815840045 | 2.425 | 1.82 | 1.546 |
| 1.963495408493635 | 2.429 | 1.823 | 1.549 |
| 1.966637001147225 | 2.432 | 1.826 | 1.552 |
| 1.969778593800815 | 2.435 | 1.829 | 1.554 |
| 1.972920186454405 | 2.439 | 1.832 | 1.557 |
| 1.976061779107994 | 2.442 | 1.835 | 1.56 |
| 1.979203371761584 | 2.445 | 1.838 | 1.563 |
| 1.982344964415174 | 2.449 | 1.841 | 1.566 |
| 1.985486557068764 | 2.452 | 1.844 | 1.568 |
| 1.988628149722354 | 2.456 | 1.847 | 1.571 |
| 1.991769742375943 | 2.459 | 1.85 | 1.574 |
| 1.994911335029533 | 2.462 | 1.853 | 1.577 |
| 1.998052927683123 | 2.466 | 1.856 | 1.58 |
| 2.001194520336712 | 2.469 | 1.859 | 1.582 |
| 2.004336112990302 | 2.472 | 1.862 | 1.585 |
| 2.007477705643892 | 2.476 | 1.865 | 1.588 |
| 2.010619298297482 | 2.479 | 1.868 | 1.591 |
| 2.013760890951071 | 2.483 | 1.871 | 1.593 |
| 2.016902483604661 | 2.486 | 1.874 | 1.596 |
| 2.02004407625825 | 2.489 | 1.878 | 1.599 |
| 2.02318566891184 | 2.493 | 1.881 | 1.601 |
| 2.02632726156543 | 2.496 | 1.884 | 1.604 |
| 2.029468854219019 | 2.5 | 1.887 | 1.607 |
| 2.032610446872609 | 2.503 | 1.89 | 1.61 |
| 2.035752039526198 | 2.506 | 1.893 | 1.612 |
| 2.038893632179788 | 2.51 | 1.896 | 1.615 |
| 2.042035224833378 | 2.513 | 1.899 | 1.618 |
| 2.045176817486967 | 2.517 | 1.902 | 1.62 |
| 2.048318410140557 | 2.52 | 1.905 | 1.623 |
| 2.051460002794146 | 2.523 | 1.908 | 1.626 |
| 2.054601595447736 | 2.527 | 1.911 | 1.628 |
| 2.057743188101325 | 2.53 | 1.914 | 1.631 |
| 2.060884780754915 | 2.534 | 1.917 | 1.634 |
| 2.064026373408505 | 2.537 | 1.92 | 1.637 |
| 2.067167966062094 | 2.541 | 1.923 | 1.639 |
| 2.070309558715684 | 2.544 | 1.926 | 1.642 |
| 2.073451151369273 | 2.548 | 1.929 | 1.644 |
| 2.076592744022863 | 2.551 | 1.932 | 1.647 |
| 2.079734336676452 | 2.555 | 1.935 | 1.65 |
| 2.082875929330042 | 2.558 | 1.938 | 1.652 |
| 2.086017521983632 | 2.562 | 1.941 | 1.655 |
| 2.089159114637221 | 2.565 | 1.944 | 1.658 |
| 2.092300707290811 | 2.568 | 1.947 | 1.66 |
| 2.095442299944401 | 2.572 | 1.95 | 1.663 |
| 2.09858389259799 | 2.575 | 1.953 | 1.666 |
| 2.10172548525158 | 2.579 | 1.956 | 1.668 |
| 2.104867077905169 | 2.582 | 1.959 | 1.671 |
| 2.108008670558759 | 2.586 | 1.962 | 1.673 |
| 2.111150263212349 | 2.589 | 1.965 | 1.676 |
| 2.114291855865938 | 2.593 | 1.968 | 1.679 |
| 2.117433448519528 | 2.597 | 1.971 | 1.681 |
| 2.120575041173117 | 2.6 | 1.974 | 1.684 |
| 2.123716633826707 | 2.604 | 1.977 | 1.686 |
| 2.126858226480297 | 2.607 | 1.98 | 1.689 |
| 2.129999819133886 | 2.611 | 1.983 | 1.691 |
| 2.133141411787476 | 2.614 | 1.986 | 1.694 |
| 2.136283004441065 | 2.618 | 1.988 | 1.697 |
| 2.139424597094655 | 2.621 | 1.991 | 1.699 |
| 2.142566189748245 | 2.625 | 1.994 | 1.702 |
| 2.145707782401834 | 2.628 | 1.997 | 1.704 |
| 2.148849375055424 | 2.632 | 2 | 1.707 |
| 2.151990967709013 | 2.636 | 2.003 | 1.709 |
| 2.155132560362603 | 2.639 | 2.006 | 1.712 |
| 2.158274153016193 | 2.643 | 2.009 | 1.714 |
| 2.161415745669782 | 2.646 | 2.012 | 1.717 |
| 2.164557338323372 | 2.65 | 2.015 | 1.719 |
| 2.167698930976961 | 2.653 | 2.018 | 1.722 |
| 2.170840523630551 | 2.657 | 2.021 | 1.724 |
| 2.173982116284141 | 2.661 | 2.024 | 1.727 |
| 2.17712370893773 | 2.664 | 2.027 | 1.729 |
| 2.18026530159132 | 2.668 | 2.03 | 1.732 |
| 2.183406894244909 | 2.671 | 2.033 | 1.734 |
| 2.186548486898499 | 2.675 | 2.036 | 1.737 |
| 2.189690079552089 | 2.679 | 2.039 | 1.739 |
| 2.192831672205678 | 2.682 | 2.042 | 1.742 |
| 2.195973264859268 | 2.686 | 2.045 | 1.744 |
| 2.199114857512857 | 2.69 | 2.048 | 1.747 |
| 2.202256450166447 | 2.693 | 2.051 | 1.749 |
| 2.205398042820036 | 2.697 | 2.053 | 1.752 |
| 2.208539635473626 | 2.701 | 2.056 | 1.754 |
| 2.211681228127216 | 2.704 | 2.059 | 1.756 |
| 2.214822820780805 | 2.708 | 2.062 | 1.759 |
| 2.217964413434395 | 2.712 | 2.065 | 1.761 |
| 2.221106006087984 | 2.715 | 2.068 | 1.764 |
| 2.224247598741574 | 2.719 | 2.071 | 1.766 |
| 2.227389191395164 | 2.723 | 2.074 | 1.769 |
| 2.230530784048753 | 2.726 | 2.077 | 1.771 |
| 2.233672376702343 | 2.73 | 2.08 | 1.773 |
| 2.236813969355933 | 2.734 | 2.083 | 1.776 |
| 2.239955562009522 | 2.737 | 2.086 | 1.778 |
| 2.243097154663112 | 2.741 | 2.089 | 1.781 |
| 2.246238747316701 | 2.745 | 2.091 | 1.783 |
| 2.249380339970291 | 2.749 | 2.094 | 1.785 |
| 2.252521932623881 | 2.752 | 2.097 | 1.788 |
| 2.25566352527747 | 2.756 | 2.1 | 1.79 |
| 2.25880511793106 | 2.76 | 2.103 | 1.793 |
| 2.261946710584649 | 2.764 | 2.106 | 1.795 |
| 2.265088303238239 | 2.767 | 2.109 | 1.797 |
| 2.268229895891829 | 2.771 | 2.112 | 1.8 |
| 2.271371488545418 | 2.775 | 2.115 | 1.802 |
| 2.274513081199008 | 2.779 | 2.118 | 1.804 |
| 2.277654673852597 | 2.782 | 2.121 | 1.807 |
| 2.280796266506186 | 2.786 | 2.123 | 1.809 |
| 2.283937859159776 | 2.79 | 2.126 | 1.811 |
| 2.287079451813366 | 2.794 | 2.129 | 1.814 |
| 2.290221044466955 | 2.798 | 2.132 | 1.816 |
| 2.293362637120545 | 2.801 | 2.135 | 1.818 |
| 2.296504229774135 | 2.805 | 2.138 | 1.821 |
| 2.299645822427724 | 2.809 | 2.141 | 1.823 |
| 2.302787415081314 | 2.813 | 2.144 | 1.825 |
| 2.305929007734904 | 2.817 | 2.147 | 1.828 |
| 2.309070600388493 | 2.821 | 2.149 | 1.83 |
| 2.312212193042083 | 2.824 | 2.152 | 1.832 |
| 2.315353785695672 | 2.828 | 2.155 | 1.835 |
| 2.318495378349262 | 2.832 | 2.158 | 1.837 |
| 2.321636971002852 | 2.836 | 2.161 | 1.839 |
| 2.324778563656441 | 2.84 | 2.164 | 1.842 |
| 2.327920156310031 | 2.844 | 2.167 | 1.844 |
| 2.33106174896362 | 2.848 | 2.17 | 1.846 |
| 2.33420334161721 | 2.851 | 2.172 | 1.848 |
| 2.3373449342708 | 2.855 | 2.175 | 1.851 |
| 2.340486526924389 | 2.859 | 2.178 | 1.853 |
| 2.343628119577979 | 2.863 | 2.181 | 1.855 |
| 2.346769712231568 | 2.867 | 2.184 | 1.857 |
| 2.349911304885158 | 2.871 | 2.187 | 1.86 |
| 2.353052897538748 | 2.875 | 2.19 | 1.862 |
| 2.356194490192337 | 2.879 | 2.192 | 1.864 |
| 2.359336082845927 | 2.883 | 2.195 | 1.866 |
| 2.362477675499516 | 2.887 | 2.198 | 1.869 |
| 2.365619268153106 | 2.891 | 2.201 | 1.871 |
| 2.368760860806696 | 2.894 | 2.204 | 1.873 |
| 2.371902453460285 | 2.898 | 2.207 | 1.875 |
| 2.375044046113875 | 2.902 | 2.21 | 1.878 |
| 2.378185638767464 | 2.906 | 2.212 | 1.88 |
| 2.381327231421054 | 2.91 | 2.215 | 1.882 |
| 2.384468824074644 | 2.914 | 2.218 | 1.884 |
| 2.387610416728233 | 2.918 | 2.221 | 1.886 |
| 2.390752009381823 | 2.922 | 2.224 | 1.889 |
| 2.393893602035412 | 2.926 | 2.227 | 1.891 |
| 2.397035194689002 | 2.93 | 2.229 | 1.893 |
| 2.400176787342591 | 2.934 | 2.232 | 1.895 |
| 2.403318379996181 | 2.938 | 2.235 | 1.897 |
| 2.406459972649771 | 2.942 | 2.238 | 1.9 |
| 2.40960156530336 | 2.946 | 2.241 | 1.902 |
| 2.41274315795695 | 2.95 | 2.244 | 1.904 |
| 2.41588475061054 | 2.954 | 2.246 | 1.906 |
| 2.419026343264129 | 2.959 | 2.249 | 1.908 |
| 2.422167935917719 | 2.963 | 2.252 | 1.91 |
| 2.425309528571308 | 2.967 | 2.255 | 1.913 |
| 2.428451121224898 | 2.971 | 2.258 | 1.915 |
| 2.431592713878488 | 2.975 | 2.261 | 1.917 |
| 2.434734306532077 | 2.979 | 2.263 | 1.919 |
| 2.437875899185667 | 2.983 | 2.266 | 1.921 |
| 2.441017491839256 | 2.987 | 2.269 | 1.923 |
| 2.444159084492846 | 2.991 | 2.272 | 1.925 |
| 2.447300677146435 | 2.995 | 2.275 | 1.928 |
| 2.450442269800025 | 2.999 | 2.277 | 1.93 |
| 2.453583862453615 | 3.004 | 2.28 | 1.932 |
| 2.456725455107204 | 3.008 | 2.283 | 1.934 |
| 2.459867047760794 | 3.012 | 2.286 | 1.936 |
| 2.463008640414384 | 3.016 | 2.289 | 1.938 |
| 2.466150233067973 | 3.02 | 2.291 | 1.94 |
| 2.469291825721563 | 3.024 | 2.294 | 1.942 |
| 2.472433418375152 | 3.028 | 2.297 | 1.945 |
| 2.475575011028742 | 3.033 | 2.3 | 1.947 |
| 2.478716603682332 | 3.037 | 2.303 | 1.949 |
| 2.481858196335921 | 3.041 | 2.305 | 1.951 |
| 2.48499978898951 | 3.045 | 2.308 | 1.953 |
| 2.4881413816431 | 3.049 | 2.311 | 1.955 |
| 2.49128297429669 | 3.054 | 2.314 | 1.957 |
| 2.49442456695028 | 3.058 | 2.317 | 1.959 |
| 2.497566159603869 | 3.062 | 2.319 | 1.961 |
| 2.500707752257458 | 3.066 | 2.322 | 1.963 |
| 2.503849344911048 | 3.07 | 2.325 | 1.965 |
| 2.506990937564638 | 3.075 | 2.328 | 1.968 |
| 2.510132530218228 | 3.079 | 2.33 | 1.97 |
| 2.513274122871817 | 3.083 | 2.333 | 1.972 |
| 2.516415715525407 | 3.087 | 2.336 | 1.974 |
| 2.519557308178996 | 3.092 | 2.339 | 1.976 |
| 2.522698900832586 | 3.096 | 2.342 | 1.978 |
| 2.525840493486176 | 3.1 | 2.344 | 1.98 |
| 2.528982086139765 | 3.105 | 2.347 | 1.982 |
| 2.532123678793355 | 3.109 | 2.35 | 1.984 |
| 2.535265271446944 | 3.113 | 2.353 | 1.986 |
| 2.538406864100534 | 3.117 | 2.355 | 1.988 |
| 2.541548456754124 | 3.122 | 2.358 | 1.99 |
| 2.544690049407713 | 3.126 | 2.361 | 1.992 |
| 2.547831642061302 | 3.13 | 2.364 | 1.994 |
| 2.550973234714892 | 3.135 | 2.366 | 1.996 |
| 2.554114827368482 | 3.139 | 2.369 | 1.998 |
| 2.557256420022072 | 3.143 | 2.372 | 2 |
| 2.560398012675661 | 3.148 | 2.375 | 2.002 |
| 2.563539605329251 | 3.152 | 2.378 | 2.004 |
| 2.56668119798284 | 3.156 | 2.38 | 2.006 |
| 2.56982279063643 | 3.161 | 2.383 | 2.008 |
| 2.57296438329002 | 3.165 | 2.386 | 2.01 |
| 2.576105975943609 | 3.17 | 2.389 | 2.012 |
| 2.579247568597199 | 3.174 | 2.391 | 2.014 |
| 2.582389161250788 | 3.178 | 2.394 | 2.016 |
| 2.585530753904377 | 3.183 | 2.397 | 2.018 |
| 2.588672346557967 | 3.187 | 2.4 | 2.02 |
| 2.591813939211557 | 3.192 | 2.402 | 2.022 |
| 2.594955531865147 | 3.196 | 2.405 | 2.024 |
| 2.598097124518736 | 3.201 | 2.408 | 2.026 |
| 2.601238717172326 | 3.205 | 2.41 | 2.028 |
| 2.604380309825915 | 3.209 | 2.413 | 2.03 |
| 2.607521902479505 | 3.214 | 2.416 | 2.032 |
| 2.610663495133095 | 3.218 | 2.419 | 2.034 |
| 2.613805087786684 | 3.223 | 2.421 | 2.036 |
| 2.616946680440274 | 3.227 | 2.424 | 2.038 |
| 2.620088273093863 | 3.232 | 2.427 | 2.04 |
| 2.623229865747452 | 3.236 | 2.43 | 2.042 |
| 2.626371458401042 | 3.241 | 2.432 | 2.044 |
| 2.629513051054632 | 3.245 | 2.435 | 2.046 |
| 2.632654643708222 | 3.25 | 2.438 | 2.048 |
| 2.635796236361811 | 3.254 | 2.441 | 2.05 |
| 2.638937829015401 | 3.259 | 2.443 | 2.052 |
| 2.642079421668991 | 3.263 | 2.446 | 2.054 |
| 2.64522101432258 | 3.268 | 2.449 | 2.056 |
| 2.64836260697617 | 3.273 | 2.451 | 2.058 |
| 2.651504199629759 | 3.277 | 2.454 | 2.06 |
| 2.654645792283349 | 3.282 | 2.457 | 2.061 |
| 2.657787384936938 | 3.286 | 2.46 | 2.063 |
| 2.660928977590528 | 3.291 | 2.462 | 2.065 |
| 2.664070570244118 | 3.295 | 2.465 | 2.067 |
| 2.667212162897707 | 3.3 | 2.468 | 2.069 |
| 2.670353755551297 | 3.305 | 2.47 | 2.071 |
| 2.673495348204887 | 3.309 | 2.473 | 2.073 |
| 2.676636940858476 | 3.314 | 2.476 | 2.075 |
| 2.679778533512066 | 3.318 | 2.479 | 2.077 |
| 2.682920126165655 | 3.323 | 2.481 | 2.079 |
| 2.686061718819245 | 3.328 | 2.484 | 2.081 |
| 2.689203311472835 | 3.332 | 2.487 | 2.083 |
| 2.692344904126424 | 3.337 | 2.489 | 2.084 |
| 2.695486496780014 | 3.342 | 2.492 | 2.086 |
| 2.698628089433603 | 3.346 | 2.495 | 2.088 |
| 2.701769682087193 | 3.351 | 2.497 | 2.09 |
| 2.704911274740782 | 3.356 | 2.5 | 2.092 |
| 2.708052867394372 | 3.36 | 2.503 | 2.094 |
| 2.711194460047962 | 3.365 | 2.506 | 2.096 |
| 2.714336052701551 | 3.37 | 2.508 | 2.098 |
| 2.717477645355141 | 3.374 | 2.511 | 2.1 |
| 2.720619238008731 | 3.379 | 2.514 | 2.102 |
| 2.72376083066232 | 3.384 | 2.516 | 2.103 |
| 2.72690242331591 | 3.389 | 2.519 | 2.105 |
| 2.730044015969499 | 3.393 | 2.522 | 2.107 |
| 2.733185608623089 | 3.398 | 2.524 | 2.109 |
| 2.736327201276678 | 3.403 | 2.527 | 2.111 |
| 2.739468793930268 | 3.408 | 2.53 | 2.113 |
| 2.742610386583858 | 3.412 | 2.532 | 2.115 |
| 2.745751979237447 | 3.417 | 2.535 | 2.117 |
| 2.748893571891036 | 3.422 | 2.538 | 2.118 |
| 2.752035164544627 | 3.427 | 2.541 | 2.12 |
| 2.755176757198216 | 3.431 | 2.543 | 2.122 |
| 2.758318349851806 | 3.436 | 2.546 | 2.124 |
| 2.761459942505395 | 3.441 | 2.549 | 2.126 |
| 2.764601535158985 | 3.446 | 2.551 | 2.128 |
| 2.767743127812574 | 3.451 | 2.554 | 2.13 |
| 2.770884720466164 | 3.455 | 2.557 | 2.131 |
| 2.774026313119754 | 3.46 | 2.559 | 2.133 |
| 2.777167905773343 | 3.465 | 2.562 | 2.135 |
| 2.780309498426932 | 3.47 | 2.565 | 2.137 |
| 2.783451091080522 | 3.475 | 2.567 | 2.139 |
| 2.786592683734112 | 3.48 | 2.57 | 2.141 |
| 2.789734276387701 | 3.484 | 2.573 | 2.143 |
| 2.792875869041291 | 3.489 | 2.575 | 2.144 |
| 2.796017461694881 | 3.494 | 2.578 | 2.146 |
| 2.79915905434847 | 3.499 | 2.581 | 2.148 |
| 2.80230064700206 | 3.504 | 2.583 | 2.15 |
| 2.80544223965565 | 3.509 | 2.586 | 2.152 |
| 2.808583832309239 | 3.514 | 2.589 | 2.154 |
| 2.811725424962829 | 3.518 | 2.591 | 2.155 |
| 2.814867017616419 | 3.523 | 2.594 | 2.157 |
| 2.818008610270008 | 3.528 | 2.597 | 2.159 |
| 2.821150202923598 | 3.533 | 2.599 | 2.161 |
| 2.824291795577187 | 3.538 | 2.602 | 2.163 |
| 2.827433388230777 | 3.543 | 2.605 | 2.165 |
| 2.830574980884366 | 3.548 | 2.607 | 2.166 |
| 2.833716573537956 | 3.553 | 2.61 | 2.168 |
| 2.836858166191546 | 3.558 | 2.613 | 2.17 |
| 2.839999758845135 | 3.563 | 2.615 | 2.172 |
| 2.843141351498725 | 3.568 | 2.618 | 2.174 |
| 2.846282944152314 | 3.573 | 2.621 | 2.175 |
| 2.849424536805904 | 3.578 | 2.623 | 2.177 |
| 2.852566129459494 | 3.583 | 2.626 | 2.179 |
| 2.855707722113083 | 3.588 | 2.629 | 2.181 |
| 2.858849314766673 | 3.593 | 2.631 | 2.183 |
| 2.861990907420262 | 3.598 | 2.634 | 2.184 |
| 2.865132500073852 | 3.602 | 2.637 | 2.186 |
| 2.868274092727442 | 3.607 | 2.639 | 2.188 |
| 2.871415685381031 | 3.612 | 2.642 | 2.19 |
| 2.874557278034621 | 3.617 | 2.644 | 2.192 |
| 2.87769887068821 | 3.622 | 2.647 | 2.193 |
| 2.8808404633418 | 3.628 | 2.65 | 2.195 |
| 2.88398205599539 | 3.633 | 2.652 | 2.197 |
| 2.88712364864898 | 3.638 | 2.655 | 2.199 |
| 2.890265241302569 | 3.643 | 2.658 | 2.201 |
| 2.893406833956158 | 3.648 | 2.66 | 2.202 |
| 2.896548426609748 | 3.653 | 2.663 | 2.204 |
| 2.899690019263338 | 3.658 | 2.666 | 2.206 |
| 2.902831611916927 | 3.663 | 2.668 | 2.208 |
| 2.905973204570517 | 3.668 | 2.671 | 2.21 |
| 2.909114797224106 | 3.673 | 2.674 | 2.211 |
| 2.912256389877696 | 3.678 | 2.676 | 2.213 |
| 2.915397982531286 | 3.683 | 2.679 | 2.215 |
| 2.918539575184875 | 3.688 | 2.681 | 2.217 |
| 2.921681167838465 | 3.693 | 2.684 | 2.219 |
| 2.924822760492054 | 3.698 | 2.687 | 2.22 |
| 2.927964353145644 | 3.703 | 2.689 | 2.222 |
| 2.931105945799234 | 3.708 | 2.692 | 2.224 |
| 2.934247538452823 | 3.713 | 2.695 | 2.226 |
| 2.937389131106413 | 3.719 | 2.697 | 2.227 |
| 2.940530723760002 | 3.724 | 2.7 | 2.229 |
| 2.943672316413592 | 3.729 | 2.703 | 2.231 |
| 2.946813909067182 | 3.734 | 2.705 | 2.233 |
| 2.949955501720771 | 3.739 | 2.708 | 2.235 |
| 2.953097094374361 | 3.744 | 2.71 | 2.236 |
| 2.95623868702795 | 3.749 | 2.713 | 2.238 |
| 2.95938027968154 | 3.754 | 2.716 | 2.24 |
| 2.96252187233513 | 3.759 | 2.718 | 2.242 |
| 2.965663464988719 | 3.765 | 2.721 | 2.243 |
| 2.968805057642309 | 3.77 | 2.724 | 2.245 |
| 2.971946650295898 | 3.775 | 2.726 | 2.247 |
| 2.975088242949488 | 3.78 | 2.729 | 2.249 |
| 2.978229835603078 | 3.785 | 2.732 | 2.25 |
| 2.981371428256667 | 3.79 | 2.734 | 2.252 |
| 2.984513020910257 | 3.795 | 2.737 | 2.254 |
| 2.987654613563846 | 3.801 | 2.739 | 2.256 |
| 2.990796206217436 | 3.806 | 2.742 | 2.258 |
| 2.993937798871025 | 3.811 | 2.745 | 2.259 |
| 2.997079391524615 | 3.816 | 2.747 | 2.261 |
| 3.000220984178205 | 3.821 | 2.75 | 2.263 |
| 3.003362576831794 | 3.826 | 2.753 | 2.265 |
| 3.006504169485384 | 3.832 | 2.755 | 2.266 |
| 3.009645762138974 | 3.837 | 2.758 | 2.268 |
| 3.012787354792563 | 3.842 | 2.76 | 2.27 |
| 3.015928947446153 | 3.847 | 2.763 | 2.272 |
| 3.019070540099742 | 3.852 | 2.766 | 2.273 |
| 3.022212132753332 | 3.857 | 2.768 | 2.275 |
| 3.025353725406922 | 3.863 | 2.771 | 2.277 |
| 3.028495318060511 | 3.868 | 2.774 | 2.279 |
| 3.031636910714101 | 3.873 | 2.776 | 2.28 |
| 3.03477850336769 | 3.878 | 2.779 | 2.282 |
| 3.03792009602128 | 3.883 | 2.781 | 2.284 |
| 3.04106168867487 | 3.889 | 2.784 | 2.286 |
| 3.04420328132846 | 3.894 | 2.787 | 2.287 |
| 3.047344873982049 | 3.899 | 2.789 | 2.289 |
| 3.050486466635638 | 3.904 | 2.792 | 2.291 |
| 3.053628059289228 | 3.909 | 2.795 | 2.293 |
| 3.056769651942818 | 3.915 | 2.797 | 2.294 |
| 3.059911244596407 | 3.92 | 2.8 | 2.296 |
| 3.063052837249997 | 3.925 | 2.802 | 2.298 |
| 3.066194429903586 | 3.93 | 2.805 | 2.3 |
| 3.069336022557176 | 3.935 | 2.808 | 2.301 |
| 3.072477615210766 | 3.941 | 2.81 | 2.303 |
| 3.075619207864355 | 3.946 | 2.813 | 2.305 |
| 3.078760800517945 | 3.951 | 2.815 | 2.307 |
| 3.081902393171534 | 3.956 | 2.818 | 2.308 |
| 3.085043985825124 | 3.962 | 2.821 | 2.31 |
| 3.088185578478713 | 3.967 | 2.823 | 2.312 |
| 3.091327171132303 | 3.972 | 2.826 | 2.314 |
| 3.094468763785893 | 3.977 | 2.829 | 2.315 |
| 3.097610356439482 | 3.983 | 2.831 | 2.317 |
| 3.100751949093072 | 3.988 | 2.834 | 2.319 |
| 3.103893541746661 | 3.993 | 2.836 | 2.321 |
| 3.107035134400251 | 3.998 | 2.839 | 2.322 |
| 3.110176727053841 | 4.003 | 2.842 | 2.324 |
| 3.11331831970743 | 4.009 | 2.844 | 2.326 |
| 3.11645991236102 | 4.014 | 2.847 | 2.328 |
| 3.11960150501461 | 4.019 | 2.85 | 2.329 |
| 3.122743097668199 | 4.024 | 2.852 | 2.331 |
| 3.125884690321789 | 4.03 | 2.855 | 2.333 |
| 3.129026282975378 | 4.035 | 2.857 | 2.335 |
| 3.132167875628968 | 4.04 | 2.86 | 2.336 |
| 3.135309468282557 | 4.045 | 2.863 | 2.338 |
| 3.138451060936147 | 4.051 | 2.865 | 2.34 |
| 3.141592653589737 | 4.056 | 2.868 | 2.342 |
| 3.144734246243326 | 4.061 | 2.87 | 2.343 |
| 3.147875838896916 | 4.066 | 2.873 | 2.345 |
| 3.151017431550505 | 4.071 | 2.876 | 2.347 |
| 3.154159024204095 | 4.077 | 2.878 | 2.349 |
| 3.157300616857685 | 4.082 | 2.881 | 2.35 |
| 3.160442209511274 | 4.087 | 2.884 | 2.352 |
| 3.163583802164864 | 4.092 | 2.886 | 2.354 |
| 3.166725394818453 | 4.098 | 2.889 | 2.356 |
| 3.169866987472043 | 4.103 | 2.891 | 2.357 |
| 3.173008580125633 | 4.108 | 2.894 | 2.359 |
| 3.176150172779222 | 4.113 | 2.897 | 2.361 |
| 3.179291765432812 | 4.119 | 2.899 | 2.363 |
| 3.182433358086401 | 4.124 | 2.902 | 2.364 |
| 3.185574950739991 | 4.129 | 2.905 | 2.366 |
| 3.188716543393581 | 4.134 | 2.907 | 2.368 |
| 3.19185813604717 | 4.14 | 2.91 | 2.37 |
| 3.19499972870076 | 4.145 | 2.912 | 2.371 |
| 3.198141321354349 | 4.15 | 2.915 | 2.373 |
| 3.20128291400794 | 4.155 | 2.918 | 2.375 |
| 3.204424506661528 | 4.16 | 2.92 | 2.377 |
| 3.207566099315118 | 4.166 | 2.923 | 2.378 |
| 3.210707691968708 | 4.171 | 2.925 | 2.38 |
| 3.213849284622297 | 4.176 | 2.928 | 2.382 |
| 3.216990877275887 | 4.181 | 2.931 | 2.384 |
| 3.220132469929476 | 4.186 | 2.933 | 2.385 |
| 3.223274062583066 | 4.192 | 2.936 | 2.387 |
| 3.226415655236656 | 4.197 | 2.939 | 2.389 |
| 3.229557247890245 | 4.202 | 2.941 | 2.391 |
| 3.232698840543835 | 4.207 | 2.944 | 2.392 |
| 3.235840433197425 | 4.213 | 2.946 | 2.394 |
| 3.238982025851014 | 4.218 | 2.949 | 2.396 |
| 3.242123618504604 | 4.223 | 2.952 | 2.398 |
| 3.245265211158193 | 4.228 | 2.954 | 2.399 |
| 3.248406803811783 | 4.233 | 2.957 | 2.401 |
| 3.251548396465373 | 4.239 | 2.96 | 2.403 |
| 3.254689989118962 | 4.244 | 2.962 | 2.405 |
| 3.257831581772551 | 4.249 | 2.965 | 2.406 |
| 3.260973174426141 | 4.254 | 2.967 | 2.408 |
| 3.26411476707973 | 4.259 | 2.97 | 2.41 |
| 3.267256359733321 | 4.264 | 2.973 | 2.412 |
| 3.27039795238691 | 4.27 | 2.975 | 2.413 |
| 3.2735395450405 | 4.275 | 2.978 | 2.415 |
| 3.276681137694089 | 4.28 | 2.981 | 2.417 |
| 3.279822730347679 | 4.285 | 2.983 | 2.419 |
| 3.282964323001269 | 4.29 | 2.986 | 2.42 |
| 3.286105915654858 | 4.296 | 2.988 | 2.422 |
| 3.289247508308448 | 4.301 | 2.991 | 2.424 |
| 3.292389100962037 | 4.306 | 2.994 | 2.426 |
| 3.295530693615627 | 4.311 | 2.996 | 2.427 |
| 3.298672286269217 | 4.316 | 2.999 | 2.429 |
| 3.301813878922806 | 4.321 | 3.002 | 2.431 |
| 3.304955471576396 | 4.326 | 3.004 | 2.433 |
| 3.308097064229985 | 4.332 | 3.007 | 2.434 |
| 3.311238656883575 | 4.337 | 3.009 | 2.436 |
| 3.314380249537165 | 4.342 | 3.012 | 2.438 |
| 3.317521842190754 | 4.347 | 3.015 | 2.44 |
| 3.320663434844344 | 4.352 | 3.017 | 2.442 |
| 3.323805027497933 | 4.357 | 3.02 | 2.443 |
| 3.326946620151523 | 4.362 | 3.023 | 2.445 |
| 3.330088212805113 | 4.368 | 3.025 | 2.447 |
| 3.333229805458702 | 4.373 | 3.028 | 2.449 |
| 3.336371398112292 | 4.378 | 3.031 | 2.45 |
| 3.339512990765881 | 4.383 | 3.033 | 2.452 |
| 3.342654583419471 | 4.388 | 3.036 | 2.454 |
| 3.345796176073061 | 4.393 | 3.038 | 2.456 |
| 3.34893776872665 | 4.398 | 3.041 | 2.458 |
| 3.35207936138024 | 4.403 | 3.044 | 2.459 |
| 3.355220954033829 | 4.408 | 3.046 | 2.461 |
| 3.358362546687419 | 4.413 | 3.049 | 2.463 |
| 3.361504139341009 | 4.418 | 3.052 | 2.465 |
| 3.364645731994598 | 4.424 | 3.054 | 2.466 |
| 3.367787324648188 | 4.429 | 3.057 | 2.468 |
| 3.370928917301777 | 4.434 | 3.06 | 2.47 |
| 3.374070509955367 | 4.439 | 3.062 | 2.472 |
| 3.377212102608956 | 4.444 | 3.065 | 2.474 |
| 3.380353695262546 | 4.449 | 3.067 | 2.475 |
| 3.383495287916136 | 4.454 | 3.07 | 2.477 |
| 3.386636880569725 | 4.459 | 3.073 | 2.479 |
| 3.389778473223315 | 4.464 | 3.075 | 2.481 |
| 3.392920065876904 | 4.469 | 3.078 | 2.483 |
| 3.396061658530494 | 4.474 | 3.081 | 2.484 |
| 3.399203251184084 | 4.479 | 3.083 | 2.486 |
| 3.402344843837673 | 4.484 | 3.086 | 2.488 |
| 3.405486436491263 | 4.489 | 3.089 | 2.49 |
| 3.408628029144852 | 4.494 | 3.091 | 2.492 |
| 3.411769621798442 | 4.499 | 3.094 | 2.493 |
| 3.414911214452032 | 4.504 | 3.097 | 2.495 |
| 3.418052807105621 | 4.509 | 3.099 | 2.497 |
| 3.421194399759211 | 4.514 | 3.102 | 2.499 |
| 3.4243359924128 | 4.519 | 3.105 | 2.501 |
| 3.42747758506639 | 4.524 | 3.107 | 2.502 |
| 3.43061917771998 | 4.529 | 3.11 | 2.504 |
| 3.433760770373569 | 4.534 | 3.112 | 2.506 |
| 3.436902363027159 | 4.539 | 3.115 | 2.508 |
| 3.440043955680748 | 4.544 | 3.118 | 2.51 |
| 3.443185548334338 | 4.549 | 3.12 | 2.511 |
| 3.446327140987927 | 4.554 | 3.123 | 2.513 |
| 3.449468733641517 | 4.559 | 3.126 | 2.515 |
| 3.452610326295107 | 4.564 | 3.128 | 2.517 |
| 3.455751918948696 | 4.569 | 3.131 | 2.519 |
| 3.458893511602286 | 4.573 | 3.134 | 2.521 |
| 3.462035104255876 | 4.578 | 3.136 | 2.522 |
| 3.465176696909465 | 4.583 | 3.139 | 2.524 |
| 3.468318289563055 | 4.588 | 3.142 | 2.526 |
| 3.471459882216644 | 4.593 | 3.144 | 2.528 |
| 3.474601474870234 | 4.598 | 3.147 | 2.53 |
| 3.477743067523824 | 4.603 | 3.15 | 2.532 |
| 3.480884660177413 | 4.608 | 3.152 | 2.533 |
| 3.484026252831002 | 4.613 | 3.155 | 2.535 |
| 3.487167845484592 | 4.617 | 3.158 | 2.537 |
| 3.490309438138182 | 4.622 | 3.16 | 2.539 |
| 3.493451030791772 | 4.627 | 3.163 | 2.541 |
| 3.496592623445361 | 4.632 | 3.166 | 2.543 |
| 3.499734216098951 | 4.637 | 3.168 | 2.544 |
| 3.50287580875254 | 4.642 | 3.171 | 2.546 |
| 3.50601740140613 | 4.647 | 3.174 | 2.548 |
| 3.50915899405972 | 4.651 | 3.176 | 2.55 |
| 3.512300586713309 | 4.656 | 3.179 | 2.552 |
| 3.515442179366899 | 4.661 | 3.182 | 2.554 |
| 3.518583772020488 | 4.666 | 3.184 | 2.555 |
| 3.521725364674078 | 4.671 | 3.187 | 2.557 |
| 3.524866957327668 | 4.675 | 3.19 | 2.559 |
| 3.528008549981257 | 4.68 | 3.193 | 2.561 |
| 3.531150142634847 | 4.685 | 3.195 | 2.563 |
| 3.534291735288436 | 4.69 | 3.198 | 2.565 |
| 3.537433327942026 | 4.694 | 3.201 | 2.567 |
| 3.540574920595616 | 4.699 | 3.203 | 2.569 |
| 3.543716513249205 | 4.704 | 3.206 | 2.57 |
| 3.546858105902795 | 4.709 | 3.209 | 2.572 |
| 3.549999698556384 | 4.714 | 3.211 | 2.574 |
| 3.553141291209974 | 4.718 | 3.214 | 2.576 |
| 3.556282883863564 | 4.723 | 3.217 | 2.578 |
| 3.559424476517153 | 4.728 | 3.219 | 2.58 |
| 3.562566069170743 | 4.732 | 3.222 | 2.582 |
| 3.565707661824332 | 4.737 | 3.225 | 2.584 |
| 3.568849254477922 | 4.742 | 3.227 | 2.585 |
| 3.571990847131511 | 4.747 | 3.23 | 2.587 |
| 3.575132439785101 | 4.751 | 3.233 | 2.589 |
| 3.578274032438691 | 4.756 | 3.236 | 2.591 |
| 3.58141562509228 | 4.761 | 3.238 | 2.593 |
| 3.58455721774587 | 4.765 | 3.241 | 2.595 |
| 3.58769881039946 | 4.77 | 3.244 | 2.597 |
| 3.590840403053049 | 4.775 | 3.246 | 2.599 |
| 3.593981995706639 | 4.779 | 3.249 | 2.601 |
| 3.597123588360228 | 4.784 | 3.252 | 2.603 |
| 3.600265181013818 | 4.788 | 3.254 | 2.604 |
| 3.603406773667407 | 4.793 | 3.257 | 2.606 |
| 3.606548366320997 | 4.798 | 3.26 | 2.608 |
| 3.609689958974587 | 4.802 | 3.263 | 2.61 |
| 3.612831551628176 | 4.807 | 3.265 | 2.612 |
| 3.615973144281766 | 4.812 | 3.268 | 2.614 |
| 3.619114736935355 | 4.816 | 3.271 | 2.616 |
| 3.622256329588945 | 4.821 | 3.273 | 2.618 |
| 3.625397922242534 | 4.825 | 3.276 | 2.62 |
| 3.628539514896124 | 4.83 | 3.279 | 2.622 |
| 3.631681107549714 | 4.834 | 3.282 | 2.624 |
| 3.634822700203303 | 4.839 | 3.284 | 2.626 |
| 3.637964292856893 | 4.844 | 3.287 | 2.628 |
| 3.641105885510483 | 4.848 | 3.29 | 2.63 |
| 3.644247478164072 | 4.853 | 3.292 | 2.631 |
| 3.647389070817662 | 4.857 | 3.295 | 2.633 |
| 3.650530663471251 | 4.862 | 3.298 | 2.635 |
| 3.653672256124841 | 4.866 | 3.301 | 2.637 |
| 3.656813848778431 | 4.871 | 3.303 | 2.639 |
| 3.65995544143202 | 4.875 | 3.306 | 2.641 |
| 3.66309703408561 | 4.88 | 3.309 | 2.643 |
| 3.666238626739199 | 4.884 | 3.312 | 2.645 |
| 3.66938021939279 | 4.889 | 3.314 | 2.647 |
| 3.672521812046378 | 4.893 | 3.317 | 2.649 |
| 3.675663404699968 | 4.898 | 3.32 | 2.651 |
| 3.678804997353558 | 4.902 | 3.323 | 2.653 |
| 3.681946590007147 | 4.907 | 3.325 | 2.655 |
| 3.685088182660737 | 4.911 | 3.328 | 2.657 |
| 3.688229775314326 | 4.915 | 3.331 | 2.659 |
| 3.691371367967916 | 4.92 | 3.333 | 2.661 |
| 3.694512960621506 | 4.924 | 3.336 | 2.663 |
| 3.697654553275095 | 4.929 | 3.339 | 2.665 |
| 3.700796145928685 | 4.933 | 3.342 | 2.667 |
| 3.703937738582274 | 4.938 | 3.344 | 2.669 |
| 3.707079331235864 | 4.942 | 3.347 | 2.671 |
| 3.710220923889454 | 4.946 | 3.35 | 2.673 |
| 3.713362516543043 | 4.951 | 3.353 | 2.675 |
| 3.716504109196633 | 4.955 | 3.355 | 2.677 |
| 3.719645701850223 | 4.959 | 3.358 | 2.679 |
| 3.722787294503812 | 4.964 | 3.361 | 2.681 |
| 3.725928887157402 | 4.968 | 3.364 | 2.683 |
| 3.729070479810991 | 4.973 | 3.366 | 2.685 |
| 3.732212072464581 | 4.977 | 3.369 | 2.687 |
| 3.735353665118171 | 4.981 | 3.372 | 2.689 |
| 3.73849525777176 | 4.986 | 3.375 | 2.691 |
| 3.74163685042535 | 4.99 | 3.378 | 2.693 |
| 3.744778443078939 | 4.994 | 3.38 | 2.695 |
| 3.747920035732529 | 4.998 | 3.383 | 2.697 |
| 3.751061628386119 | 5.003 | 3.386 | 2.699 |
| 3.754203221039708 | 5.007 | 3.389 | 2.701 |
| 3.757344813693298 | 5.011 | 3.391 | 2.703 |
| 3.760486406346887 | 5.016 | 3.394 | 2.705 |
| 3.763627999000477 | 5.02 | 3.397 | 2.707 |
| 3.766769591654067 | 5.024 | 3.4 | 2.709 |
| 3.769911184307656 | 5.028 | 3.402 | 2.712 |
| 3.773052776961246 | 5.033 | 3.405 | 2.714 |
| 3.776194369614835 | 5.037 | 3.408 | 2.716 |
| 3.779335962268425 | 5.041 | 3.411 | 2.718 |
| 3.782477554922014 | 5.045 | 3.414 | 2.72 |
| 3.785619147575604 | 5.05 | 3.416 | 2.722 |
| 3.788760740229193 | 5.054 | 3.419 | 2.724 |
| 3.791902332882783 | 5.058 | 3.422 | 2.726 |
| 3.795043925536373 | 5.062 | 3.425 | 2.728 |
| 3.798185518189962 | 5.066 | 3.428 | 2.73 |
| 3.801327110843552 | 5.071 | 3.43 | 2.732 |
| 3.804468703497142 | 5.075 | 3.433 | 2.734 |
| 3.807610296150731 | 5.079 | 3.436 | 2.737 |
| 3.810751888804321 | 5.083 | 3.439 | 2.739 |
| 3.813893481457911 | 5.087 | 3.442 | 2.741 |
| 3.8170350741115 | 5.091 | 3.444 | 2.743 |
| 3.82017666676509 | 5.096 | 3.447 | 2.745 |
| 3.823318259418679 | 5.1 | 3.45 | 2.747 |
| 3.826459852072269 | 5.104 | 3.453 | 2.749 |
| 3.829601444725859 | 5.108 | 3.456 | 2.751 |
| 3.832743037379448 | 5.112 | 3.458 | 2.753 |
| 3.835884630033038 | 5.116 | 3.461 | 2.756 |
| 3.839026222686627 | 5.12 | 3.464 | 2.758 |
| 3.842167815340217 | 5.124 | 3.467 | 2.76 |
| 3.845309407993807 | 5.129 | 3.47 | 2.762 |
| 3.848451000647396 | 5.133 | 3.472 | 2.764 |
| 3.851592593300986 | 5.137 | 3.475 | 2.766 |
| 3.854734185954575 | 5.141 | 3.478 | 2.768 |
| 3.857875778608165 | 5.145 | 3.481 | 2.771 |
| 3.861017371261755 | 5.149 | 3.484 | 2.773 |
| 3.864158963915344 | 5.153 | 3.486 | 2.775 |
| 3.867300556568933 | 5.157 | 3.489 | 2.777 |
| 3.870442149222523 | 5.161 | 3.492 | 2.779 |
| 3.873583741876112 | 5.165 | 3.495 | 2.781 |
| 3.876725334529703 | 5.169 | 3.498 | 2.784 |
| 3.879866927183292 | 5.173 | 3.501 | 2.786 |
| 3.883008519836882 | 5.177 | 3.503 | 2.788 |
| 3.886150112490471 | 5.181 | 3.506 | 2.79 |
| 3.889291705144061 | 5.185 | 3.509 | 2.792 |
| 3.892433297797651 | 5.189 | 3.512 | 2.795 |
| 3.89557489045124 | 5.193 | 3.515 | 2.797 |
| 3.89871648310483 | 5.197 | 3.518 | 2.799 |
| 3.901858075758419 | 5.201 | 3.52 | 2.801 |
| 3.904999668412009 | 5.205 | 3.523 | 2.803 |
| 3.908141261065598 | 5.209 | 3.526 | 2.806 |
| 3.911282853719188 | 5.213 | 3.529 | 2.808 |
| 3.914424446372778 | 5.217 | 3.532 | 2.81 |
| 3.917566039026367 | 5.221 | 3.535 | 2.812 |
| 3.920707631679957 | 5.225 | 3.538 | 2.815 |
| 3.923849224333547 | 5.229 | 3.54 | 2.817 |
| 3.926990816987136 | 5.233 | 3.543 | 2.819 |
| 3.930132409640726 | 5.237 | 3.546 | 2.821 |
| 3.933274002294315 | 5.241 | 3.549 | 2.824 |
| 3.936415594947905 | 5.245 | 3.552 | 2.826 |
| 3.939557187601495 | 5.248 | 3.555 | 2.828 |
| 3.942698780255084 | 5.252 | 3.558 | 2.83 |
| 3.945840372908674 | 5.256 | 3.56 | 2.833 |
| 3.948981965562263 | 5.26 | 3.563 | 2.835 |
| 3.952123558215853 | 5.264 | 3.566 | 2.837 |
| 3.955265150869442 | 5.268 | 3.569 | 2.839 |
| 3.958406743523032 | 5.272 | 3.572 | 2.842 |
| 3.961548336176622 | 5.276 | 3.575 | 2.844 |
| 3.964689928830211 | 5.28 | 3.578 | 2.846 |
| 3.967831521483801 | 5.283 | 3.581 | 2.849 |
| 3.97097311413739 | 5.287 | 3.583 | 2.851 |
| 3.97411470679098 | 5.291 | 3.586 | 2.853 |
| 3.97725629944457 | 5.295 | 3.589 | 2.855 |
| 3.98039789209816 | 5.299 | 3.592 | 2.858 |
| 3.983539484751749 | 5.303 | 3.595 | 2.86 |
| 3.986681077405338 | 5.306 | 3.598 | 2.862 |
| 3.989822670058928 | 5.31 | 3.601 | 2.865 |
| 3.992964262712517 | 5.314 | 3.604 | 2.867 |
| 3.996105855366107 | 5.318 | 3.607 | 2.869 |
| 3.999247448019697 | 5.322 | 3.609 | 2.872 |
| 4.002389040673287 | 5.325 | 3.612 | 2.874 |
| 4.005530633326877 | 5.329 | 3.615 | 2.876 |
| 4.008672225980466 | 5.333 | 3.618 | 2.879 |
| 4.011813818634056 | 5.337 | 3.621 | 2.881 |
| 4.014955411287645 | 5.34 | 3.624 | 2.883 |
| 4.018097003941234 | 5.344 | 3.627 | 2.886 |
| 4.021238596594824 | 5.348 | 3.63 | 2.888 |
| 4.024380189248414 | 5.352 | 3.633 | 2.891 |
| 4.027521781902004 | 5.355 | 3.636 | 2.893 |
| 4.030663374555593 | 5.359 | 3.638 | 2.895 |
| 4.033804967209183 | 5.363 | 3.641 | 2.898 |
| 4.036946559862773 | 5.367 | 3.644 | 2.9 |
| 4.040088152516362 | 5.37 | 3.647 | 2.903 |
| 4.043229745169951 | 5.374 | 3.65 | 2.905 |
| 4.046371337823541 | 5.378 | 3.653 | 2.907 |
| 4.049512930477131 | 5.381 | 3.656 | 2.91 |
| 4.05265452313072 | 5.385 | 3.659 | 2.912 |
| 4.05579611578431 | 5.389 | 3.662 | 2.915 |
| 4.0589377084379 | 5.393 | 3.665 | 2.917 |
| 4.062079301091489 | 5.396 | 3.668 | 2.919 |
| 4.065220893745079 | 5.4 | 3.671 | 2.922 |
| 4.068362486398668 | 5.404 | 3.673 | 2.924 |
| 4.071504079052258 | 5.407 | 3.676 | 2.927 |
| 4.074645671705848 | 5.411 | 3.679 | 2.929 |
| 4.077787264359437 | 5.415 | 3.682 | 2.932 |
| 4.080928857013027 | 5.418 | 3.685 | 2.934 |
| 4.084070449666616 | 5.422 | 3.688 | 2.937 |
| 4.087212042320206 | 5.426 | 3.691 | 2.939 |
| 4.090353634973795 | 5.429 | 3.694 | 2.941 |
| 4.093495227627385 | 5.433 | 3.697 | 2.944 |
| 4.096636820280975 | 5.436 | 3.7 | 2.946 |
| 4.099778412934564 | 5.44 | 3.703 | 2.949 |
| 4.102920005588154 | 5.444 | 3.706 | 2.951 |
| 4.106061598241744 | 5.447 | 3.709 | 2.954 |
| 4.109203190895333 | 5.451 | 3.712 | 2.956 |
| 4.112344783548923 | 5.455 | 3.715 | 2.959 |
| 4.115486376202512 | 5.458 | 3.718 | 2.961 |
| 4.118627968856102 | 5.462 | 3.721 | 2.964 |
| 4.121769561509692 | 5.465 | 3.724 | 2.966 |
| 4.124911154163281 | 5.469 | 3.726 | 2.969 |
| 4.128052746816871 | 5.472 | 3.729 | 2.971 |
| 4.13119433947046 | 5.476 | 3.732 | 2.974 |
| 4.13433593212405 | 5.48 | 3.735 | 2.977 |
| 4.13747752477764 | 5.483 | 3.738 | 2.979 |
| 4.14061911743123 | 5.487 | 3.741 | 2.982 |
| 4.143760710084818 | 5.49 | 3.744 | 2.984 |
| 4.146902302738408 | 5.494 | 3.747 | 2.987 |
| 4.150043895391998 | 5.497 | 3.75 | 2.989 |
| 4.153185488045588 | 5.501 | 3.753 | 2.992 |
| 4.156327080699177 | 5.504 | 3.756 | 2.994 |
| 4.159468673352766 | 5.508 | 3.759 | 2.997 |
| 4.162610266006356 | 5.512 | 3.762 | 3 |
| 4.165751858659946 | 5.515 | 3.765 | 3.002 |
| 4.168893451313535 | 5.519 | 3.768 | 3.005 |
| 4.172035043967125 | 5.522 | 3.771 | 3.007 |
| 4.175176636620715 | 5.526 | 3.774 | 3.01 |
| 4.178318229274304 | 5.529 | 3.777 | 3.012 |
| 4.181459821927894 | 5.533 | 3.78 | 3.015 |
| 4.184601414581484 | 5.536 | 3.783 | 3.018 |
| 4.187743007235073 | 5.54 | 3.786 | 3.02 |
| 4.190884599888663 | 5.543 | 3.789 | 3.023 |
| 4.194026192542252 | 5.547 | 3.792 | 3.026 |
| 4.197167785195842 | 5.55 | 3.795 | 3.028 |
| 4.200309377849432 | 5.554 | 3.798 | 3.031 |
| 4.203450970503021 | 5.557 | 3.801 | 3.033 |
| 4.206592563156611 | 5.56 | 3.804 | 3.036 |
| 4.2097341558102 | 5.564 | 3.807 | 3.039 |
| 4.21287574846379 | 5.567 | 3.81 | 3.041 |
| 4.21601734111738 | 5.571 | 3.813 | 3.044 |
| 4.21915893377097 | 5.574 | 3.816 | 3.047 |
| 4.222300526424559 | 5.578 | 3.819 | 3.049 |
| 4.225442119078148 | 5.581 | 3.822 | 3.052 |
| 4.228583711731738 | 5.585 | 3.825 | 3.055 |
| 4.231725304385327 | 5.588 | 3.828 | 3.057 |
| 4.234866897038917 | 5.592 | 3.831 | 3.06 |
| 4.238008489692506 | 5.595 | 3.834 | 3.063 |
| 4.241150082346096 | 5.598 | 3.837 | 3.065 |
| 4.244291674999685 | 5.602 | 3.84 | 3.068 |
| 4.247433267653276 | 5.605 | 3.843 | 3.071 |
| 4.250574860306865 | 5.609 | 3.846 | 3.074 |
| 4.253716452960455 | 5.612 | 3.849 | 3.076 |
| 4.256858045614044 | 5.615 | 3.852 | 3.079 |
| 4.259999638267634 | 5.619 | 3.855 | 3.082 |
| 4.263141230921224 | 5.622 | 3.858 | 3.084 |
| 4.266282823574813 | 5.626 | 3.861 | 3.087 |
| 4.269424416228403 | 5.629 | 3.864 | 3.09 |
| 4.272566008881992 | 5.632 | 3.867 | 3.093 |
| 4.275707601535582 | 5.636 | 3.87 | 3.095 |
| 4.27884919418917 | 5.639 | 3.873 | 3.098 |
| 4.28199078684276 | 5.643 | 3.876 | 3.101 |
| 4.285132379496351 | 5.646 | 3.879 | 3.104 |
| 4.28827397214994 | 5.649 | 3.882 | 3.106 |
| 4.29141556480353 | 5.653 | 3.886 | 3.109 |
| 4.294557157457119 | 5.656 | 3.889 | 3.112 |
| 4.29769875011071 | 5.659 | 3.892 | 3.115 |
| 4.300840342764299 | 5.663 | 3.895 | 3.118 |
| 4.303981935417888 | 5.666 | 3.898 | 3.12 |
| 4.307123528071478 | 5.669 | 3.901 | 3.123 |
| 4.310265120725067 | 5.673 | 3.904 | 3.126 |
| 4.313406713378657 | 5.676 | 3.907 | 3.129 |
| 4.316548306032247 | 5.68 | 3.91 | 3.132 |
| 4.319689898685836 | 5.683 | 3.913 | 3.134 |
| 4.322831491339426 | 5.686 | 3.916 | 3.137 |
| 4.325973083993015 | 5.69 | 3.919 | 3.14 |
| 4.329114676646605 | 5.693 | 3.922 | 3.143 |
| 4.332256269300195 | 5.696 | 3.925 | 3.146 |
| 4.335397861953784 | 5.699 | 3.928 | 3.148 |
| 4.338539454607374 | 5.703 | 3.931 | 3.151 |
| 4.341681047260963 | 5.706 | 3.934 | 3.154 |
| 4.344822639914553 | 5.709 | 3.937 | 3.157 |
| 4.347964232568143 | 5.713 | 3.94 | 3.16 |
| 4.351105825221732 | 5.716 | 3.944 | 3.163 |
| 4.354247417875322 | 5.719 | 3.947 | 3.166 |
| 4.357389010528911 | 5.723 | 3.95 | 3.168 |
| 4.360530603182501 | 5.726 | 3.953 | 3.171 |
| 4.36367219583609 | 5.729 | 3.956 | 3.174 |
| 4.36681378848968 | 5.733 | 3.959 | 3.177 |
| 4.36995538114327 | 5.736 | 3.962 | 3.18 |
| 4.373096973796859 | 5.739 | 3.965 | 3.183 |
| 4.376238566450449 | 5.742 | 3.968 | 3.186 |
| 4.379380159104038 | 5.746 | 3.971 | 3.189 |
| 4.382521751757628 | 5.749 | 3.974 | 3.191 |
| 4.385663344411217 | 5.752 | 3.977 | 3.194 |
| 4.388804937064807 | 5.756 | 3.98 | 3.197 |
| 4.391946529718397 | 5.759 | 3.983 | 3.2 |
| 4.395088122371987 | 5.762 | 3.987 | 3.203 |
| 4.398229715025576 | 5.765 | 3.99 | 3.206 |
| 4.401371307679165 | 5.769 | 3.993 | 3.209 |
| 4.404512900332755 | 5.772 | 3.996 | 3.212 |
| 4.407654492986345 | 5.775 | 3.999 | 3.215 |
| 4.410796085639934 | 5.778 | 4.002 | 3.218 |
| 4.413937678293524 | 5.782 | 4.005 | 3.221 |
| 4.417079270947114 | 5.785 | 4.008 | 3.224 |
| 4.420220863600703 | 5.788 | 4.011 | 3.227 |
| 4.423362456254293 | 5.791 | 4.014 | 3.229 |
| 4.426504048907883 | 5.795 | 4.017 | 3.232 |
| 4.429645641561472 | 5.798 | 4.021 | 3.235 |
| 4.432787234215062 | 5.801 | 4.024 | 3.238 |
| 4.435928826868651 | 5.804 | 4.027 | 3.241 |
| 4.43907041952224 | 5.808 | 4.03 | 3.244 |
| 4.44221201217583 | 5.811 | 4.033 | 3.247 |
| 4.44535360482942 | 5.814 | 4.036 | 3.25 |
| 4.44849519748301 | 5.817 | 4.039 | 3.253 |
| 4.4516367901366 | 5.821 | 4.042 | 3.256 |
| 4.454778382790188 | 5.824 | 4.045 | 3.259 |
| 4.457919975443779 | 5.827 | 4.048 | 3.262 |
| 4.461061568097368 | 5.83 | 4.052 | 3.265 |
| 4.464203160750958 | 5.833 | 4.055 | 3.268 |
| 4.467344753404547 | 5.837 | 4.058 | 3.271 |
| 4.470486346058137 | 5.84 | 4.061 | 3.274 |
| 4.473627938711726 | 5.843 | 4.064 | 3.277 |
| 4.476769531365316 | 5.846 | 4.067 | 3.28 |
| 4.479911124018905 | 5.85 | 4.07 | 3.283 |
| 4.483052716672495 | 5.853 | 4.073 | 3.286 |
| 4.486194309326085 | 5.856 | 4.076 | 3.289 |
| 4.489335901979674 | 5.859 | 4.079 | 3.292 |
| 4.492477494633264 | 5.862 | 4.083 | 3.295 |
| 4.495619087286854 | 5.866 | 4.086 | 3.298 |
| 4.498760679940443 | 5.869 | 4.089 | 3.301 |
| 4.501902272594033 | 5.872 | 4.092 | 3.304 |
| 4.505043865247622 | 5.875 | 4.095 | 3.307 |
| 4.508185457901212 | 5.878 | 4.098 | 3.31 |
| 4.511327050554801 | 5.882 | 4.101 | 3.313 |
| 4.514468643208391 | 5.885 | 4.104 | 3.317 |
| 4.517610235861981 | 5.888 | 4.108 | 3.32 |
| 4.520751828515571 | 5.891 | 4.111 | 3.323 |
| 4.52389342116916 | 5.894 | 4.114 | 3.326 |
| 4.52703501382275 | 5.897 | 4.117 | 3.329 |
| 4.530176606476339 | 5.901 | 4.12 | 3.332 |
| 4.533318199129928 | 5.904 | 4.123 | 3.335 |
| 4.536459791783518 | 5.907 | 4.126 | 3.338 |
| 4.539601384437108 | 5.91 | 4.129 | 3.341 |
| 4.542742977090698 | 5.913 | 4.132 | 3.344 |
| 4.545884569744287 | 5.917 | 4.136 | 3.347 |
| 4.549026162397876 | 5.92 | 4.139 | 3.35 |
| 4.552167755051466 | 5.923 | 4.142 | 3.353 |
| 4.555309347705056 | 5.926 | 4.145 | 3.356 |
| 4.558450940358646 | 5.929 | 4.148 | 3.359 |
| 4.561592533012235 | 5.932 | 4.151 | 3.363 |
| 4.564734125665825 | 5.936 | 4.154 | 3.366 |
| 4.567875718319415 | 5.939 | 4.157 | 3.369 |
| 4.571017310973004 | 5.942 | 4.161 | 3.372 |
| 4.574158903626594 | 5.945 | 4.164 | 3.375 |
| 4.577300496280183 | 5.948 | 4.167 | 3.378 |
| 4.580442088933772 | 5.951 | 4.17 | 3.381 |
| 4.583583681587362 | 5.955 | 4.173 | 3.384 |
| 4.586725274240952 | 5.958 | 4.176 | 3.387 |
| 4.589866866894542 | 5.961 | 4.179 | 3.39 |
| 4.593008459548131 | 5.964 | 4.183 | 3.393 |
| 4.596150052201721 | 5.967 | 4.186 | 3.397 |
| 4.59929164485531 | 5.97 | 4.189 | 3.4 |
| 4.6024332375089 | 5.974 | 4.192 | 3.403 |
| 4.60557483016249 | 5.977 | 4.195 | 3.406 |
| 4.608716422816079 | 5.98 | 4.198 | 3.409 |
| 4.611858015469668 | 5.983 | 4.201 | 3.412 |
| 4.614999608123258 | 5.986 | 4.204 | 3.415 |
| 4.618141200776848 | 5.989 | 4.208 | 3.418 |
| 4.621282793430437 | 5.992 | 4.211 | 3.422 |
| 4.624424386084027 | 5.996 | 4.214 | 3.425 |
| 4.627565978737617 | 5.999 | 4.217 | 3.428 |
| 4.630707571391206 | 6.002 | 4.22 | 3.431 |
| 4.633849164044795 | 6.005 | 4.223 | 3.434 |
| 4.636990756698386 | 6.008 | 4.226 | 3.437 |
| 4.640132349351975 | 6.011 | 4.23 | 3.44 |
| 4.643273942005564 | 6.015 | 4.233 | 3.443 |
| 4.646415534659154 | 6.018 | 4.236 | 3.447 |
| 4.649557127312744 | 6.021 | 4.239 | 3.45 |
| 4.652698719966334 | 6.024 | 4.242 | 3.453 |
| 4.655840312619923 | 6.027 | 4.245 | 3.456 |
| 4.658981905273513 | 6.03 | 4.248 | 3.459 |
| 4.662123497927102 | 6.033 | 4.252 | 3.462 |
| 4.665265090580692 | 6.037 | 4.255 | 3.465 |
| 4.668406683234282 | 6.04 | 4.258 | 3.468 |
| 4.671548275887871 | 6.043 | 4.261 | 3.472 |
| 4.674689868541461 | 6.046 | 4.264 | 3.475 |
| 4.67783146119505 | 6.049 | 4.267 | 3.478 |
| 4.68097305384864 | 6.052 | 4.27 | 3.481 |
| 4.68411464650223 | 6.055 | 4.274 | 3.484 |
| 4.687256239155819 | 6.059 | 4.277 | 3.487 |
| 4.690397831809409 | 6.062 | 4.28 | 3.49 |
| 4.693539424462998 | 6.065 | 4.283 | 3.494 |
| 4.696681017116588 | 6.068 | 4.286 | 3.497 |
| 4.699822609770177 | 6.071 | 4.289 | 3.5 |
| 4.702964202423767 | 6.074 | 4.292 | 3.503 |
| 4.706105795077356 | 6.077 | 4.296 | 3.506 |
| 4.709247387730946 | 6.081 | 4.299 | 3.509 |
| 4.712388980384535 | 6.084 | 4.302 | 3.512 |
| 4.715530573038126 | 6.087 | 4.305 | 3.516 |
| 4.718672165691715 | 6.09 | 4.308 | 3.519 |
| 4.721813758345305 | 6.093 | 4.311 | 3.522 |
| 4.724955350998894 | 6.096 | 4.314 | 3.525 |
| 4.728096943652484 | 6.099 | 4.318 | 3.528 |
| 4.731238536306074 | 6.103 | 4.321 | 3.531 |
| 4.734380128959663 | 6.106 | 4.324 | 3.534 |
| 4.737521721613253 | 6.109 | 4.327 | 3.538 |
| 4.740663314266842 | 6.112 | 4.33 | 3.541 |
| 4.743804906920432 | 6.115 | 4.333 | 3.544 |
| 4.74694649957402 | 6.118 | 4.336 | 3.547 |
| 4.750088092227611 | 6.121 | 4.339 | 3.55 |
| 4.7532296848812 | 6.125 | 4.343 | 3.553 |
| 4.75637127753479 | 6.128 | 4.346 | 3.556 |
| 4.75951287018838 | 6.131 | 4.349 | 3.56 |
| 4.76265446284197 | 6.134 | 4.352 | 3.563 |
| 4.765796055495559 | 6.137 | 4.355 | 3.566 |
| 4.768937648149149 | 6.14 | 4.358 | 3.569 |
| 4.772079240802738 | 6.143 | 4.361 | 3.572 |
| 4.775220833456327 | 6.147 | 4.365 | 3.575 |
| 4.778362426109917 | 6.15 | 4.368 | 3.578 |
| 4.781504018763507 | 6.153 | 4.371 | 3.581 |
| 4.784645611417097 | 6.156 | 4.374 | 3.585 |
| 4.787787204070686 | 6.159 | 4.377 | 3.588 |
| 4.790928796724275 | 6.162 | 4.38 | 3.591 |
| 4.794070389377865 | 6.165 | 4.383 | 3.594 |
| 4.797211982031455 | 6.169 | 4.387 | 3.597 |
| 4.800353574685045 | 6.172 | 4.39 | 3.6 |
| 4.803495167338634 | 6.175 | 4.393 | 3.603 |
| 4.806636759992224 | 6.178 | 4.396 | 3.606 |
| 4.809778352645814 | 6.181 | 4.399 | 3.61 |
| 4.812919945299403 | 6.184 | 4.402 | 3.613 |
| 4.816061537952993 | 6.187 | 4.405 | 3.616 |
| 4.819203130606582 | 6.191 | 4.409 | 3.619 |
| 4.822344723260172 | 6.194 | 4.412 | 3.622 |
| 4.825486315913761 | 6.197 | 4.415 | 3.625 |
| 4.828627908567351 | 6.2 | 4.418 | 3.628 |
| 4.83176950122094 | 6.203 | 4.421 | 3.631 |
| 4.83491109387453 | 6.206 | 4.424 | 3.634 |
| 4.83805268652812 | 6.21 | 4.427 | 3.638 |
| 4.841194279181709 | 6.213 | 4.43 | 3.641 |
| 4.844335871835299 | 6.216 | 4.434 | 3.644 |
| 4.847477464488889 | 6.219 | 4.437 | 3.647 |
| 4.850619057142478 | 6.222 | 4.44 | 3.65 |
| 4.853760649796068 | 6.225 | 4.443 | 3.653 |
| 4.856902242449657 | 6.229 | 4.446 | 3.656 |
| 4.860043835103247 | 6.232 | 4.449 | 3.659 |
| 4.863185427756837 | 6.235 | 4.452 | 3.662 |
| 4.866327020410426 | 6.238 | 4.455 | 3.665 |
| 4.869468613064015 | 6.241 | 4.459 | 3.668 |
| 4.872610205717605 | 6.244 | 4.462 | 3.672 |
| 4.875751798371195 | 6.248 | 4.465 | 3.675 |
| 4.878893391024784 | 6.251 | 4.468 | 3.678 |
| 4.882034983678374 | 6.254 | 4.471 | 3.681 |
| 4.885176576331964 | 6.257 | 4.474 | 3.684 |
| 4.888318168985553 | 6.26 | 4.477 | 3.687 |
| 4.891459761639143 | 6.264 | 4.48 | 3.69 |
| 4.894601354292733 | 6.267 | 4.484 | 3.693 |
| 4.897742946946322 | 6.27 | 4.487 | 3.696 |
| 4.900884539599912 | 6.273 | 4.49 | 3.699 |
| 4.904026132253501 | 6.276 | 4.493 | 3.702 |
| 4.907167724907091 | 6.279 | 4.496 | 3.705 |
| 4.91030931756068 | 6.283 | 4.499 | 3.708 |
| 4.91345091021427 | 6.286 | 4.502 | 3.711 |
| 4.91659250286786 | 6.289 | 4.505 | 3.714 |
| 4.91973409552145 | 6.292 | 4.509 | 3.717 |
| 4.922875688175039 | 6.295 | 4.512 | 3.72 |
| 4.926017280828628 | 6.299 | 4.515 | 3.724 |
| 4.929158873482218 | 6.302 | 4.518 | 3.727 |
| 4.932300466135808 | 6.305 | 4.521 | 3.73 |
| 4.935442058789397 | 6.308 | 4.524 | 3.733 |
| 4.938583651442987 | 6.311 | 4.527 | 3.736 |
| 4.941725244096576 | 6.315 | 4.53 | 3.739 |
| 4.944866836750166 | 6.318 | 4.533 | 3.742 |
| 4.948008429403755 | 6.321 | 4.537 | 3.745 |
| 4.951150022057345 | 6.324 | 4.54 | 3.748 |
| 4.954291614710935 | 6.327 | 4.543 | 3.751 |
| 4.957433207364524 | 6.331 | 4.546 | 3.754 |
| 4.960574800018114 | 6.334 | 4.549 | 3.757 |
| 4.963716392671704 | 6.337 | 4.552 | 3.76 |
| 4.966857985325293 | 6.34 | 4.555 | 3.763 |
| 4.969999577978883 | 6.344 | 4.558 | 3.766 |
| 4.973141170632472 | 6.347 | 4.561 | 3.769 |
| 4.976282763286062 | 6.35 | 4.564 | 3.772 |
| 4.979424355939651 | 6.353 | 4.568 | 3.775 |
| 4.982565948593241 | 6.356 | 4.571 | 3.778 |
| 4.985707541246831 | 6.36 | 4.574 | 3.781 |
| 4.98884913390042 | 6.363 | 4.577 | 3.784 |
| 4.99199072655401 | 6.366 | 4.58 | 3.786 |
| 4.9951323192076 | 6.369 | 4.583 | 3.789 |
| 4.99827391186119 | 6.373 | 4.586 | 3.792 |
| 5.00141550451478 | 6.376 | 4.589 | 3.795 |
| 5.004557097168369 | 6.379 | 4.592 | 3.798 |
| 5.007698689821958 | 6.382 | 4.595 | 3.801 |
| 5.010840282475548 | 6.386 | 4.599 | 3.804 |
| 5.013981875129137 | 6.389 | 4.602 | 3.807 |
| 5.017123467782727 | 6.392 | 4.605 | 3.81 |
| 5.020265060436317 | 6.395 | 4.608 | 3.813 |
| 5.023406653089906 | 6.399 | 4.611 | 3.816 |
| 5.026548245743496 | 6.402 | 4.614 | 3.819 |
| 5.029689838397085 | 6.405 | 4.617 | 3.822 |
| 5.032831431050674 | 6.409 | 4.62 | 3.825 |
| 5.035973023704264 | 6.412 | 4.623 | 3.828 |
| 5.039114616357854 | 6.415 | 4.626 | 3.83 |
| 5.042256209011444 | 6.418 | 4.629 | 3.833 |
| 5.045397801665033 | 6.422 | 4.632 | 3.836 |
| 5.048539394318622 | 6.425 | 4.636 | 3.839 |
| 5.051680986972213 | 6.428 | 4.639 | 3.842 |
| 5.054822579625802 | 6.431 | 4.642 | 3.845 |
| 5.057964172279392 | 6.435 | 4.645 | 3.848 |
| 5.061105764932981 | 6.438 | 4.648 | 3.851 |
| 5.064247357586571 | 6.441 | 4.651 | 3.854 |
| 5.067388950240161 | 6.445 | 4.654 | 3.856 |
| 5.07053054289375 | 6.448 | 4.657 | 3.859 |
| 5.07367213554734 | 6.451 | 4.66 | 3.862 |
| 5.07681372820093 | 6.455 | 4.663 | 3.865 |
| 5.079955320854519 | 6.458 | 4.666 | 3.868 |
| 5.083096913508108 | 6.461 | 4.669 | 3.871 |
| 5.086238506161698 | 6.465 | 4.672 | 3.874 |
| 5.089380098815288 | 6.468 | 4.675 | 3.876 |
| 5.092521691468877 | 6.471 | 4.678 | 3.879 |
| 5.095663284122466 | 6.474 | 4.681 | 3.882 |
| 5.098804876776057 | 6.478 | 4.685 | 3.885 |
| 5.101946469429646 | 6.481 | 4.688 | 3.888 |
| 5.105088062083236 | 6.484 | 4.691 | 3.89 |
| 5.108229654736825 | 6.488 | 4.694 | 3.893 |
| 5.111371247390415 | 6.491 | 4.697 | 3.896 |
| 5.114512840044005 | 6.495 | 4.7 | 3.899 |
| 5.117654432697594 | 6.498 | 4.703 | 3.902 |
| 5.120796025351184 | 6.501 | 4.706 | 3.904 |
| 5.123937618004773 | 6.505 | 4.709 | 3.907 |
| 5.127079210658363 | 6.508 | 4.712 | 3.91 |
| 5.130220803311953 | 6.511 | 4.715 | 3.913 |
| 5.133362395965542 | 6.515 | 4.718 | 3.916 |
| 5.136503988619131 | 6.518 | 4.721 | 3.918 |
| 5.13964558127272 | 6.521 | 4.724 | 3.921 |
| 5.142787173926311 | 6.525 | 4.727 | 3.924 |
| 5.1459287665799 | 6.528 | 4.73 | 3.927 |
| 5.14907035923349 | 6.532 | 4.733 | 3.929 |
| 5.15221195188708 | 6.535 | 4.736 | 3.932 |
| 5.15535354454067 | 6.538 | 4.739 | 3.935 |
| 5.158495137194259 | 6.542 | 4.742 | 3.938 |
| 5.161636729847848 | 6.545 | 4.745 | 3.94 |
| 5.164778322501438 | 6.548 | 4.748 | 3.943 |
| 5.167919915155028 | 6.552 | 4.751 | 3.946 |
| 5.171061507808617 | 6.555 | 4.754 | 3.949 |
| 5.174203100462206 | 6.559 | 4.757 | 3.951 |
| 5.177344693115796 | 6.562 | 4.76 | 3.954 |
| 5.180486285769386 | 6.566 | 4.764 | 3.957 |
| 5.183627878422976 | 6.569 | 4.767 | 3.959 |
| 5.186769471076565 | 6.572 | 4.77 | 3.962 |
| 5.189911063730155 | 6.576 | 4.773 | 3.965 |
| 5.193052656383744 | 6.579 | 4.776 | 3.967 |
| 5.196194249037334 | 6.583 | 4.779 | 3.97 |
| 5.199335841690924 | 6.586 | 4.782 | 3.973 |
| 5.202477434344513 | 6.59 | 4.785 | 3.975 |
| 5.205619026998103 | 6.593 | 4.788 | 3.978 |
| 5.208760619651692 | 6.596 | 4.791 | 3.981 |
| 5.211902212305282 | 6.6 | 4.794 | 3.983 |
| 5.215043804958871 | 6.603 | 4.797 | 3.986 |
| 5.218185397612461 | 6.607 | 4.8 | 3.989 |
| 5.221326990266051 | 6.61 | 4.803 | 3.991 |
| 5.22446858291964 | 6.614 | 4.806 | 3.994 |
| 5.22761017557323 | 6.617 | 4.809 | 3.997 |
| 5.23075176822682 | 6.621 | 4.812 | 3.999 |
| 5.23389336088041 | 6.624 | 4.815 | 4.002 |
| 5.237034953533999 | 6.628 | 4.818 | 4.005 |
| 5.240176546187588 | 6.631 | 4.821 | 4.007 |
| 5.243318138841178 | 6.635 | 4.824 | 4.01 |
| 5.246459731494767 | 6.638 | 4.827 | 4.012 |
| 5.249601324148357 | 6.642 | 4.83 | 4.015 |
| 5.252742916801947 | 6.645 | 4.833 | 4.018 |
| 5.255884509455536 | 6.649 | 4.836 | 4.02 |
| 5.259026102109125 | 6.652 | 4.839 | 4.023 |
| 5.262167694762715 | 6.656 | 4.841 | 4.025 |
| 5.265309287416305 | 6.659 | 4.844 | 4.028 |
| 5.268450880069895 | 6.663 | 4.847 | 4.03 |
| 5.271592472723484 | 6.666 | 4.85 | 4.033 |
| 5.274734065377074 | 6.67 | 4.853 | 4.036 |
| 5.277875658030664 | 6.674 | 4.856 | 4.038 |
| 5.281017250684253 | 6.677 | 4.859 | 4.041 |
| 5.284158843337843 | 6.681 | 4.862 | 4.043 |
| 5.287300435991432 | 6.684 | 4.865 | 4.046 |
| 5.290442028645022 | 6.688 | 4.868 | 4.048 |
| 5.293583621298612 | 6.691 | 4.871 | 4.051 |
| 5.296725213952201 | 6.695 | 4.874 | 4.053 |
| 5.299866806605791 | 6.698 | 4.877 | 4.056 |
| 5.30300839925938 | 6.702 | 4.88 | 4.058 |
| 5.30614999191297 | 6.706 | 4.883 | 4.061 |
| 5.30929158456656 | 6.709 | 4.886 | 4.063 |
| 5.312433177220149 | 6.713 | 4.889 | 4.066 |
| 5.315574769873739 | 6.716 | 4.892 | 4.068 |
| 5.318716362527328 | 6.72 | 4.895 | 4.071 |
| 5.321857955180918 | 6.724 | 4.898 | 4.073 |
| 5.324999547834508 | 6.727 | 4.901 | 4.076 |
| 5.328141140488097 | 6.731 | 4.904 | 4.078 |
| 5.331282733141686 | 6.735 | 4.907 | 4.081 |
| 5.334424325795276 | 6.738 | 4.91 | 4.083 |
| 5.337565918448866 | 6.742 | 4.913 | 4.086 |
| 5.340707511102456 | 6.745 | 4.915 | 4.088 |
| 5.343849103756045 | 6.749 | 4.918 | 4.091 |
| 5.346990696409634 | 6.753 | 4.921 | 4.093 |
| 5.350132289063224 | 6.756 | 4.924 | 4.096 |
| 5.353273881716814 | 6.76 | 4.927 | 4.098 |
| 5.356415474370403 | 6.764 | 4.93 | 4.101 |
| 5.359557067023993 | 6.767 | 4.933 | 4.103 |
| 5.362698659677583 | 6.771 | 4.936 | 4.105 |
| 5.365840252331172 | 6.775 | 4.939 | 4.108 |
| 5.368981844984762 | 6.778 | 4.942 | 4.11 |
| 5.372123437638351 | 6.782 | 4.945 | 4.113 |
| 5.375265030291941 | 6.786 | 4.948 | 4.115 |
| 5.378406622945531 | 6.79 | 4.951 | 4.117 |
| 5.38154821559912 | 6.793 | 4.954 | 4.12 |
| 5.38468980825271 | 6.797 | 4.956 | 4.122 |
| 5.387831400906299 | 6.801 | 4.959 | 4.125 |
| 5.39097299355989 | 6.804 | 4.962 | 4.127 |
| 5.394114586213479 | 6.808 | 4.965 | 4.129 |
| 5.397256178867068 | 6.812 | 4.968 | 4.132 |
| 5.400397771520657 | 6.816 | 4.971 | 4.134 |
| 5.403539364174247 | 6.819 | 4.974 | 4.137 |
| 5.406680956827837 | 6.823 | 4.977 | 4.139 |
| 5.409822549481426 | 6.827 | 4.98 | 4.141 |
| 5.412964142135016 | 6.831 | 4.983 | 4.144 |
| 5.416105734788605 | 6.834 | 4.986 | 4.146 |
| 5.419247327442195 | 6.838 | 4.988 | 4.148 |
| 5.422388920095785 | 6.842 | 4.991 | 4.151 |
| 5.425530512749375 | 6.846 | 4.994 | 4.153 |
| 5.428672105402964 | 6.85 | 4.997 | 4.155 |
| 5.431813698056554 | 6.853 | 5 | 4.158 |
| 5.434955290710143 | 6.857 | 5.003 | 4.16 |
| 5.438096883363733 | 6.861 | 5.006 | 4.162 |
| 5.441238476017322 | 6.865 | 5.009 | 4.165 |
| 5.444380068670912 | 6.869 | 5.012 | 4.167 |
| 5.447521661324502 | 6.872 | 5.014 | 4.169 |
| 5.450663253978091 | 6.876 | 5.017 | 4.172 |
| 5.453804846631681 | 6.88 | 5.02 | 4.174 |
| 5.456946439285271 | 6.884 | 5.023 | 4.176 |
| 5.46008803193886 | 6.888 | 5.026 | 4.179 |
| 5.46322962459245 | 6.892 | 5.029 | 4.181 |
| 5.466371217246039 | 6.896 | 5.032 | 4.183 |
| 5.46951280989963 | 6.899 | 5.035 | 4.185 |
| 5.472654402553218 | 6.903 | 5.037 | 4.188 |
| 5.475795995206808 | 6.907 | 5.04 | 4.19 |
| 5.478937587860398 | 6.911 | 5.043 | 4.192 |
| 5.482079180513987 | 6.915 | 5.046 | 4.195 |
| 5.485220773167577 | 6.919 | 5.049 | 4.197 |
| 5.488362365821166 | 6.923 | 5.052 | 4.199 |
| 5.491503958474756 | 6.927 | 5.055 | 4.201 |
| 5.494645551128346 | 6.931 | 5.057 | 4.204 |
| 5.497787143781935 | 6.935 | 5.06 | 4.206 |
| 5.500928736435525 | 6.938 | 5.063 | 4.208 |
| 5.504070329089115 | 6.942 | 5.066 | 4.21 |
| 5.507211921742704 | 6.946 | 5.069 | 4.213 |
| 5.510353514396294 | 6.95 | 5.072 | 4.215 |
| 5.513495107049883 | 6.954 | 5.075 | 4.217 |
| 5.516636699703473 | 6.958 | 5.077 | 4.219 |
| 5.519778292357062 | 6.962 | 5.08 | 4.221 |
| 5.522919885010652 | 6.966 | 5.083 | 4.224 |
| 5.526061477664242 | 6.97 | 5.086 | 4.226 |
| 5.529203070317831 | 6.974 | 5.089 | 4.228 |
| 5.532344662971421 | 6.978 | 5.092 | 4.23 |
| 5.535486255625011 | 6.982 | 5.094 | 4.232 |
| 5.5386278482786 | 6.986 | 5.097 | 4.235 |
| 5.54176944093219 | 6.99 | 5.1 | 4.237 |
| 5.544911033585779 | 6.994 | 5.103 | 4.239 |
| 5.54805262623937 | 6.998 | 5.106 | 4.241 |
| 5.551194218892959 | 7.002 | 5.109 | 4.243 |
| 5.554335811546548 | 7.006 | 5.111 | 4.246 |
| 5.557477404200137 | 7.01 | 5.114 | 4.248 |
| 5.560618996853727 | 7.014 | 5.117 | 4.25 |
| 5.563760589507317 | 7.018 | 5.12 | 4.252 |
| 5.566902182160906 | 7.022 | 5.123 | 4.254 |
| 5.570043774814496 | 7.026 | 5.126 | 4.256 |
| 5.573185367468086 | 7.031 | 5.128 | 4.259 |
| 5.576326960121675 | 7.035 | 5.131 | 4.261 |
| 5.579468552775264 | 7.039 | 5.134 | 4.263 |
| 5.582610145428854 | 7.043 | 5.137 | 4.265 |
| 5.585751738082444 | 7.047 | 5.14 | 4.267 |
| 5.588893330736034 | 7.051 | 5.142 | 4.269 |
| 5.592034923389623 | 7.055 | 5.145 | 4.271 |
| 5.595176516043213 | 7.059 | 5.148 | 4.273 |
| 5.598318108696803 | 7.063 | 5.151 | 4.276 |
| 5.601459701350392 | 7.068 | 5.154 | 4.278 |
| 5.604601294003982 | 7.072 | 5.156 | 4.28 |
| 5.607742886657571 | 7.076 | 5.159 | 4.282 |
| 5.610884479311161 | 7.08 | 5.162 | 4.284 |
| 5.61402607196475 | 7.084 | 5.165 | 4.286 |
| 5.61716766461834 | 7.088 | 5.168 | 4.288 |
| 5.62030925727193 | 7.093 | 5.17 | 4.29 |
| 5.623450849925519 | 7.097 | 5.173 | 4.292 |
| 5.626592442579109 | 7.101 | 5.176 | 4.295 |
| 5.629734035232698 | 7.105 | 5.179 | 4.297 |
| 5.632875627886288 | 7.109 | 5.182 | 4.299 |
| 5.636017220539878 | 7.114 | 5.184 | 4.301 |
| 5.639158813193467 | 7.118 | 5.187 | 4.303 |
| 5.642300405847057 | 7.122 | 5.19 | 4.305 |
| 5.645441998500646 | 7.126 | 5.193 | 4.307 |
| 5.648583591154236 | 7.13 | 5.196 | 4.309 |
| 5.651725183807825 | 7.135 | 5.198 | 4.311 |
| 5.654866776461415 | 7.139 | 5.201 | 4.313 |
| 5.658008369115005 | 7.143 | 5.204 | 4.315 |
| 5.661149961768594 | 7.147 | 5.207 | 4.317 |
| 5.664291554422184 | 7.152 | 5.209 | 4.319 |
| 5.667433147075774 | 7.156 | 5.212 | 4.321 |
| 5.670574739729363 | 7.16 | 5.215 | 4.324 |
| 5.673716332382953 | 7.165 | 5.218 | 4.326 |
| 5.676857925036542 | 7.169 | 5.221 | 4.328 |
| 5.679999517690132 | 7.173 | 5.223 | 4.33 |
| 5.683141110343721 | 7.178 | 5.226 | 4.332 |
| 5.686282702997311 | 7.182 | 5.229 | 4.334 |
| 5.689424295650901 | 7.186 | 5.232 | 4.336 |
| 5.69256588830449 | 7.19 | 5.234 | 4.338 |
| 5.69570748095808 | 7.195 | 5.237 | 4.34 |
| 5.69884907361167 | 7.199 | 5.24 | 4.342 |
| 5.701990666265259 | 7.204 | 5.243 | 4.344 |
| 5.705132258918849 | 7.208 | 5.245 | 4.346 |
| 5.708273851572438 | 7.212 | 5.248 | 4.348 |
| 5.711415444226028 | 7.217 | 5.251 | 4.35 |
| 5.714557036879618 | 7.221 | 5.254 | 4.352 |
| 5.717698629533207 | 7.225 | 5.256 | 4.354 |
| 5.720840222186797 | 7.23 | 5.259 | 4.356 |
| 5.723981814840386 | 7.234 | 5.262 | 4.358 |
| 5.727123407493976 | 7.239 | 5.265 | 4.36 |
| 5.730265000147565 | 7.243 | 5.267 | 4.362 |
| 5.733406592801155 | 7.247 | 5.27 | 4.364 |
| 5.736548185454744 | 7.252 | 5.273 | 4.366 |
| 5.739689778108334 | 7.256 | 5.276 | 4.368 |
| 5.742831370761924 | 7.261 | 5.278 | 4.37 |
| 5.745972963415514 | 7.265 | 5.281 | 4.372 |
| 5.749114556069103 | 7.27 | 5.284 | 4.374 |
| 5.752256148722693 | 7.274 | 5.287 | 4.376 |
| 5.755397741376282 | 7.279 | 5.289 | 4.378 |
| 5.758539334029872 | 7.283 | 5.292 | 4.38 |
| 5.761680926683462 | 7.288 | 5.295 | 4.382 |
| 5.764822519337051 | 7.292 | 5.298 | 4.384 |
| 5.767964111990641 | 7.297 | 5.3 | 4.386 |
| 5.77110570464423 | 7.301 | 5.303 | 4.387 |
| 5.77424729729782 | 7.306 | 5.306 | 4.389 |
| 5.77738888995141 | 7.31 | 5.308 | 4.391 |
| 5.780530482605 | 7.315 | 5.311 | 4.393 |
| 5.783672075258588 | 7.319 | 5.314 | 4.395 |
| 5.786813667912178 | 7.324 | 5.317 | 4.397 |
| 5.789955260565768 | 7.328 | 5.319 | 4.399 |
| 5.793096853219358 | 7.333 | 5.322 | 4.401 |
| 5.796238445872947 | 7.337 | 5.325 | 4.403 |
| 5.799380038526537 | 7.342 | 5.327 | 4.405 |
| 5.802521631180126 | 7.347 | 5.33 | 4.407 |
| 5.805663223833715 | 7.351 | 5.333 | 4.409 |
| 5.808804816487306 | 7.356 | 5.336 | 4.411 |
| 5.811946409140895 | 7.36 | 5.338 | 4.413 |
| 5.815088001794485 | 7.365 | 5.341 | 4.415 |
| 5.818229594448074 | 7.37 | 5.344 | 4.417 |
| 5.821371187101663 | 7.374 | 5.346 | 4.418 |
| 5.824512779755254 | 7.379 | 5.349 | 4.42 |
| 5.827654372408843 | 7.384 | 5.352 | 4.422 |
| 5.830795965062433 | 7.388 | 5.355 | 4.424 |
| 5.833937557716022 | 7.393 | 5.357 | 4.426 |
| 5.837079150369612 | 7.397 | 5.36 | 4.428 |
| 5.840220743023201 | 7.402 | 5.363 | 4.43 |
| 5.843362335676791 | 7.407 | 5.365 | 4.432 |
| 5.846503928330381 | 7.411 | 5.368 | 4.434 |
| 5.84964552098397 | 7.416 | 5.371 | 4.436 |
| 5.85278711363756 | 7.421 | 5.373 | 4.437 |
| 5.85592870629115 | 7.426 | 5.376 | 4.439 |
| 5.85907029894474 | 7.43 | 5.379 | 4.441 |
| 5.862211891598329 | 7.435 | 5.382 | 4.443 |
| 5.865353484251918 | 7.44 | 5.384 | 4.445 |
| 5.868495076905508 | 7.444 | 5.387 | 4.447 |
| 5.871636669559098 | 7.449 | 5.39 | 4.449 |
| 5.874778262212687 | 7.454 | 5.392 | 4.451 |
| 5.877919854866277 | 7.459 | 5.395 | 4.453 |
| 5.881061447519866 | 7.463 | 5.398 | 4.454 |
| 5.884203040173456 | 7.468 | 5.4 | 4.456 |
| 5.887344632827046 | 7.473 | 5.403 | 4.458 |
| 5.890486225480635 | 7.478 | 5.406 | 4.46 |
| 5.893627818134224 | 7.482 | 5.408 | 4.462 |
| 5.896769410787814 | 7.487 | 5.411 | 4.464 |
| 5.899911003441404 | 7.492 | 5.414 | 4.466 |
| 5.903052596094994 | 7.497 | 5.416 | 4.467 |
| 5.906194188748583 | 7.502 | 5.419 | 4.469 |
| 5.909335781402172 | 7.506 | 5.422 | 4.471 |
| 5.912477374055762 | 7.511 | 5.424 | 4.473 |
| 5.915618966709352 | 7.516 | 5.427 | 4.475 |
| 5.918760559362942 | 7.521 | 5.43 | 4.477 |
| 5.921902152016531 | 7.526 | 5.433 | 4.479 |
| 5.92504374467012 | 7.53 | 5.435 | 4.48 |
| 5.92818533732371 | 7.535 | 5.438 | 4.482 |
| 5.9313269299773 | 7.54 | 5.441 | 4.484 |
| 5.93446852263089 | 7.545 | 5.443 | 4.486 |
| 5.93761011528448 | 7.55 | 5.446 | 4.488 |
| 5.940751707938068 | 7.555 | 5.449 | 4.49 |
| 5.943893300591658 | 7.56 | 5.451 | 4.491 |
| 5.947034893245248 | 7.564 | 5.454 | 4.493 |
| 5.950176485898837 | 7.569 | 5.457 | 4.495 |
| 5.953318078552427 | 7.574 | 5.459 | 4.497 |
| 5.956459671206017 | 7.579 | 5.462 | 4.499 |
| 5.959601263859606 | 7.584 | 5.465 | 4.501 |
| 5.962742856513196 | 7.589 | 5.467 | 4.502 |
| 5.965884449166785 | 7.594 | 5.47 | 4.504 |
| 5.969026041820375 | 7.599 | 5.473 | 4.506 |
| 5.972167634473964 | 7.604 | 5.475 | 4.508 |
| 5.975309227127554 | 7.609 | 5.478 | 4.51 |
| 5.978450819781144 | 7.614 | 5.48 | 4.512 |
| 5.981592412434733 | 7.619 | 5.483 | 4.513 |
| 5.984734005088323 | 7.623 | 5.486 | 4.515 |
| 5.987875597741913 | 7.628 | 5.488 | 4.517 |
| 5.991017190395502 | 7.633 | 5.491 | 4.519 |
| 5.994158783049092 | 7.638 | 5.494 | 4.521 |
| 5.997300375702681 | 7.643 | 5.496 | 4.522 |
| 6.000441968356271 | 7.648 | 5.499 | 4.524 |
| 6.003583561009861 | 7.653 | 5.502 | 4.526 |
| 6.00672515366345 | 7.658 | 5.504 | 4.528 |
| 6.00986674631704 | 7.663 | 5.507 | 4.53 |
| 6.01300833897063 | 7.668 | 5.51 | 4.531 |
| 6.01614993162422 | 7.673 | 5.512 | 4.533 |
| 6.019291524277808 | 7.678 | 5.515 | 4.535 |
| 6.022433116931398 | 7.683 | 5.518 | 4.537 |
| 6.025574709584988 | 7.688 | 5.52 | 4.539 |
| 6.028716302238577 | 7.693 | 5.523 | 4.54 |
| 6.031857894892167 | 7.698 | 5.526 | 4.542 |
| 6.034999487545757 | 7.703 | 5.528 | 4.544 |
| 6.038141080199346 | 7.708 | 5.531 | 4.546 |
| 6.041282672852935 | 7.713 | 5.534 | 4.548 |
| 6.044424265506525 | 7.718 | 5.536 | 4.549 |
| 6.047565858160115 | 7.724 | 5.539 | 4.551 |
| 6.050707450813704 | 7.729 | 5.541 | 4.553 |
| 6.053849043467294 | 7.734 | 5.544 | 4.555 |
| 6.056990636120884 | 7.739 | 5.547 | 4.557 |
| 6.060132228774473 | 7.744 | 5.549 | 4.558 |
| 6.063273821428063 | 7.749 | 5.552 | 4.56 |
| 6.066415414081653 | 7.754 | 5.555 | 4.562 |
| 6.069557006735242 | 7.759 | 5.557 | 4.564 |
| 6.072698599388831 | 7.764 | 5.56 | 4.566 |
| 6.07584019204242 | 7.769 | 5.563 | 4.567 |
| 6.078981784696011 | 7.774 | 5.565 | 4.569 |
| 6.082123377349601 | 7.779 | 5.568 | 4.571 |
| 6.08526497000319 | 7.784 | 5.57 | 4.573 |
| 6.08840656265678 | 7.79 | 5.573 | 4.574 |
| 6.09154815531037 | 7.795 | 5.576 | 4.576 |
| 6.094689747963959 | 7.8 | 5.578 | 4.578 |
| 6.097831340617549 | 7.805 | 5.581 | 4.58 |
| 6.100972933271138 | 7.81 | 5.584 | 4.581 |
| 6.104114525924728 | 7.815 | 5.586 | 4.583 |
| 6.107256118578317 | 7.82 | 5.589 | 4.585 |
| 6.110397711231907 | 7.825 | 5.592 | 4.587 |
| 6.113539303885497 | 7.831 | 5.594 | 4.589 |
| 6.116680896539086 | 7.836 | 5.597 | 4.59 |
| 6.119822489192675 | 7.841 | 5.599 | 4.592 |
| 6.122964081846265 | 7.846 | 5.602 | 4.594 |
| 6.126105674499855 | 7.851 | 5.605 | 4.596 |
| 6.129247267153445 | 7.856 | 5.607 | 4.597 |
| 6.132388859807034 | 7.861 | 5.61 | 4.599 |
| 6.135530452460624 | 7.867 | 5.613 | 4.601 |
| 6.138672045114213 | 7.872 | 5.615 | 4.603 |
| 6.141813637767803 | 7.877 | 5.618 | 4.604 |
| 6.144955230421393 | 7.882 | 5.62 | 4.606 |
| 6.148096823074982 | 7.887 | 5.623 | 4.608 |
| 6.151238415728571 | 7.892 | 5.626 | 4.61 |
| 6.154380008382161 | 7.898 | 5.628 | 4.611 |
| 6.157521601035751 | 7.903 | 5.631 | 4.613 |
| 6.16066319368934 | 7.908 | 5.634 | 4.615 |
| 6.16380478634293 | 7.913 | 5.636 | 4.617 |
| 6.16694637899652 | 7.918 | 5.639 | 4.619 |
| 6.170087971650109 | 7.924 | 5.641 | 4.62 |
| 6.173229564303698 | 7.929 | 5.644 | 4.622 |
| 6.176371156957289 | 7.934 | 5.647 | 4.624 |
| 6.179512749610878 | 7.939 | 5.649 | 4.626 |
| 6.182654342264468 | 7.944 | 5.652 | 4.627 |
| 6.185795934918057 | 7.95 | 5.655 | 4.629 |
| 6.188937527571647 | 7.955 | 5.657 | 4.631 |
| 6.192079120225237 | 7.96 | 5.66 | 4.633 |
| 6.195220712878826 | 7.965 | 5.662 | 4.634 |
| 6.198362305532415 | 7.97 | 5.665 | 4.636 |
| 6.201503898186005 | 7.976 | 5.668 | 4.638 |
| 6.204645490839594 | 7.981 | 5.67 | 4.64 |
| 6.207787083493184 | 7.986 | 5.673 | 4.641 |
| 6.210928676146774 | 7.991 | 5.676 | 4.643 |
| 6.214070268800364 | 7.996 | 5.678 | 4.645 |
| 6.217211861453953 | 8.002 | 5.681 | 4.647 |
| 6.220353454107543 | 8.007 | 5.683 | 4.648 |
| 6.223495046761133 | 8.012 | 5.686 | 4.65 |
| 6.226636639414722 | 8.017 | 5.689 | 4.652 |
| 6.229778232068312 | 8.023 | 5.691 | 4.654 |
| 6.232919824721901 | 8.028 | 5.694 | 4.655 |
| 6.236061417375491 | 8.033 | 5.696 | 4.657 |
| 6.23920301002908 | 8.038 | 5.699 | 4.659 |
| 6.24234460268267 | 8.044 | 5.702 | 4.661 |
| 6.24548619533626 | 8.049 | 5.704 | 4.662 |
| 6.24862778798985 | 8.054 | 5.707 | 4.664 |
| 6.251769380643438 | 8.059 | 5.71 | 4.666 |
| 6.254910973297028 | 8.064 | 5.712 | 4.667 |
| 6.258052565950618 | 8.07 | 5.715 | 4.669 |
| 6.261194158604208 | 8.075 | 5.717 | 4.671 |
| 6.264335751257797 | 8.08 | 5.72 | 4.673 |
| 6.267477343911387 | 8.085 | 5.723 | 4.674 |
| 6.270618936564976 | 8.091 | 5.725 | 4.676 |
| 6.273760529218566 | 8.096 | 5.728 | 4.678 |
| 6.276902121872155 | 8.101 | 5.731 | 4.68 |
| 6.280043714525745 | 8.106 | 5.733 | 4.681 |
| 6.283185307179335 | 8.112 | 5.736 | 4.683 |